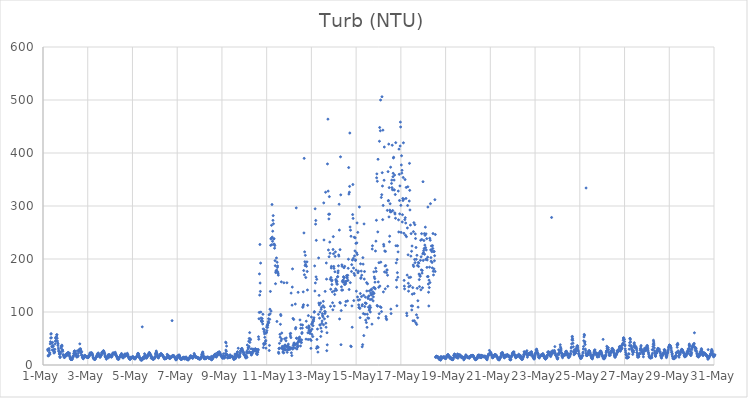
| Category | Turb (NTU) |
|---|---|
| 44317.208333333336 | 29.53 |
| 44317.21875 | 27.1 |
| 44317.229166666664 | 16.99 |
| 44317.239583333336 | 17.84 |
| 44317.25 | 17.74 |
| 44317.260416666664 | 18.66 |
| 44317.270833333336 | 31.04 |
| 44317.28125 | 28.05 |
| 44317.291666666664 | 23.07 |
| 44317.302083333336 | 23.04 |
| 44317.3125 | 20.38 |
| 44317.322916666664 | 39.78 |
| 44317.333333333336 | 43.83 |
| 44317.34375 | 50.93 |
| 44317.354166666664 | 58.24 |
| 44317.364583333336 | 59.13 |
| 44317.375 | 51.38 |
| 44317.385416666664 | 41.22 |
| 44317.395833333336 | 34.42 |
| 44317.40625 | 34.26 |
| 44317.416666666664 | 28.32 |
| 44317.427083333336 | 42.71 |
| 44317.4375 | 35.92 |
| 44317.447916666664 | 36.87 |
| 44317.458333333336 | 34.78 |
| 44317.46875 | 28.79 |
| 44317.479166666664 | 25.3 |
| 44317.489583333336 | 22.58 |
| 44317.5 | 28.66 |
| 44317.510416666664 | 23.36 |
| 44317.520833333336 | 24.81 |
| 44317.53125 | 29.56 |
| 44317.541666666664 | 39.72 |
| 44317.552083333336 | 45.12 |
| 44317.5625 | 51.73 |
| 44317.572916666664 | 50.09 |
| 44317.583333333336 | 44.76 |
| 44317.59375 | 50.29 |
| 44317.604166666664 | 53.54 |
| 44317.614583333336 | 57.08 |
| 44317.625 | 57.01 |
| 44317.635416666664 | 50.52 |
| 44317.645833333336 | 45.25 |
| 44317.65625 | 41.47 |
| 44317.666666666664 | 36.71 |
| 44317.677083333336 | 39.83 |
| 44317.6875 | 31.88 |
| 44317.697916666664 | 28.23 |
| 44317.708333333336 | 25.63 |
| 44317.71875 | 25.11 |
| 44317.729166666664 | 21.02 |
| 44317.739583333336 | 20.57 |
| 44317.75 | 16.08 |
| 44317.760416666664 | 14.14 |
| 44317.770833333336 | 15.19 |
| 44317.78125 | 21.49 |
| 44317.791666666664 | 24.6 |
| 44317.802083333336 | 31.92 |
| 44317.8125 | 35.14 |
| 44317.822916666664 | 35 |
| 44317.833333333336 | 34.84 |
| 44317.84375 | 37.42 |
| 44317.854166666664 | 35.84 |
| 44317.864583333336 | 28.8 |
| 44317.875 | 27.91 |
| 44317.885416666664 | 25.69 |
| 44317.895833333336 | 19.6 |
| 44317.90625 | 18.58 |
| 44317.916666666664 | 17.79 |
| 44317.927083333336 | 17.18 |
| 44317.9375 | 18.83 |
| 44317.947916666664 | 14.11 |
| 44317.958333333336 | 15.33 |
| 44317.96875 | 14.29 |
| 44317.979166666664 | 17.85 |
| 44317.989583333336 | 16.66 |
| 44318.0 | 16.65 |
| 44318.010416666664 | 17.85 |
| 44318.020833333336 | 16.72 |
| 44318.03125 | 19.64 |
| 44318.041666666664 | 19.91 |
| 44318.052083333336 | 21.29 |
| 44318.0625 | 20.39 |
| 44318.072916666664 | 21.08 |
| 44318.083333333336 | 21.4 |
| 44318.09375 | 18.51 |
| 44318.104166666664 | 22.32 |
| 44318.114583333336 | 22.82 |
| 44318.125 | 23.64 |
| 44318.135416666664 | 22.68 |
| 44318.145833333336 | 21.34 |
| 44318.15625 | 20.07 |
| 44318.166666666664 | 19.1 |
| 44318.177083333336 | 17.94 |
| 44318.1875 | 22.18 |
| 44318.197916666664 | 15.66 |
| 44318.208333333336 | 14.94 |
| 44318.21875 | 12.81 |
| 44318.229166666664 | 12.83 |
| 44318.239583333336 | 11.03 |
| 44318.25 | 10.22 |
| 44318.260416666664 | 10.58 |
| 44318.270833333336 | 11.24 |
| 44318.28125 | 10.34 |
| 44318.291666666664 | 10.76 |
| 44318.302083333336 | 10.43 |
| 44318.3125 | 12.4 |
| 44318.322916666664 | 14.1 |
| 44318.333333333336 | 15.01 |
| 44318.34375 | 14.95 |
| 44318.354166666664 | 17.51 |
| 44318.364583333336 | 16.93 |
| 44318.375 | 21.42 |
| 44318.385416666664 | 22.53 |
| 44318.395833333336 | 25.87 |
| 44318.40625 | 26.01 |
| 44318.416666666664 | 26.57 |
| 44318.427083333336 | 24.41 |
| 44318.4375 | 21.35 |
| 44318.447916666664 | 19.76 |
| 44318.458333333336 | 20.77 |
| 44318.46875 | 19.41 |
| 44318.479166666664 | 21.72 |
| 44318.489583333336 | 17.41 |
| 44318.5 | 17.72 |
| 44318.510416666664 | 15.11 |
| 44318.520833333336 | 15.17 |
| 44318.53125 | 26.71 |
| 44318.541666666664 | 16.85 |
| 44318.552083333336 | 16.05 |
| 44318.5625 | 16.69 |
| 44318.572916666664 | 17.76 |
| 44318.583333333336 | 22.44 |
| 44318.59375 | 27.04 |
| 44318.604166666664 | 27.56 |
| 44318.614583333336 | 26.81 |
| 44318.625 | 26.16 |
| 44318.635416666664 | 29.93 |
| 44318.645833333336 | 39.86 |
| 44318.65625 | 27.91 |
| 44318.666666666664 | 29.31 |
| 44318.677083333336 | 30.81 |
| 44318.6875 | 28.32 |
| 44318.697916666664 | 23.15 |
| 44318.708333333336 | 23.34 |
| 44318.71875 | 19.08 |
| 44318.729166666664 | 25.36 |
| 44318.739583333336 | 17.54 |
| 44318.75 | 18.35 |
| 44318.760416666664 | 14.62 |
| 44318.770833333336 | 14.75 |
| 44318.78125 | 12.84 |
| 44318.791666666664 | 13.35 |
| 44318.802083333336 | 11.7 |
| 44318.8125 | 13.34 |
| 44318.822916666664 | 13.95 |
| 44318.833333333336 | 14.89 |
| 44318.84375 | 15.34 |
| 44318.854166666664 | 18.13 |
| 44318.864583333336 | 15.1 |
| 44318.875 | 17.7 |
| 44318.885416666664 | 17.43 |
| 44318.895833333336 | 16.58 |
| 44318.90625 | 17.09 |
| 44318.916666666664 | 15.9 |
| 44318.927083333336 | 15.28 |
| 44318.9375 | 15.33 |
| 44318.947916666664 | 14.93 |
| 44318.958333333336 | 15.12 |
| 44318.96875 | 15.95 |
| 44318.979166666664 | 15.41 |
| 44318.989583333336 | 14.54 |
| 44319.0 | 14.38 |
| 44319.010416666664 | 13.8 |
| 44319.020833333336 | 14.1 |
| 44319.03125 | 14.95 |
| 44319.041666666664 | 16.16 |
| 44319.052083333336 | 15.88 |
| 44319.0625 | 16.38 |
| 44319.072916666664 | 18.39 |
| 44319.083333333336 | 19.4 |
| 44319.09375 | 22.23 |
| 44319.104166666664 | 20.69 |
| 44319.114583333336 | 23.03 |
| 44319.125 | 19.7 |
| 44319.135416666664 | 20.81 |
| 44319.145833333336 | 21.09 |
| 44319.15625 | 20.76 |
| 44319.166666666664 | 22.94 |
| 44319.177083333336 | 22.87 |
| 44319.1875 | 22.3 |
| 44319.197916666664 | 21.02 |
| 44319.208333333336 | 19.9 |
| 44319.21875 | 18.74 |
| 44319.229166666664 | 16.94 |
| 44319.239583333336 | 14.85 |
| 44319.25 | 13.61 |
| 44319.260416666664 | 12.91 |
| 44319.270833333336 | 11.56 |
| 44319.28125 | 11.71 |
| 44319.291666666664 | 11.11 |
| 44319.302083333336 | 11 |
| 44319.3125 | 10.37 |
| 44319.322916666664 | 11.26 |
| 44319.333333333336 | 10.89 |
| 44319.34375 | 12.75 |
| 44319.354166666664 | 13.73 |
| 44319.364583333336 | 14 |
| 44319.375 | 14.42 |
| 44319.385416666664 | 15.07 |
| 44319.395833333336 | 15.05 |
| 44319.40625 | 17.58 |
| 44319.416666666664 | 17.94 |
| 44319.427083333336 | 19.94 |
| 44319.4375 | 20.94 |
| 44319.447916666664 | 19.8 |
| 44319.458333333336 | 19.84 |
| 44319.46875 | 22.8 |
| 44319.479166666664 | 19.33 |
| 44319.489583333336 | 21.02 |
| 44319.5 | 17.43 |
| 44319.510416666664 | 17.71 |
| 44319.520833333336 | 16.61 |
| 44319.53125 | 16.15 |
| 44319.541666666664 | 15.07 |
| 44319.552083333336 | 14.6 |
| 44319.5625 | 15.49 |
| 44319.572916666664 | 16.82 |
| 44319.583333333336 | 17.85 |
| 44319.59375 | 17.68 |
| 44319.604166666664 | 18.45 |
| 44319.614583333336 | 20.36 |
| 44319.625 | 22.56 |
| 44319.635416666664 | 23.91 |
| 44319.645833333336 | 24.15 |
| 44319.65625 | 23.94 |
| 44319.666666666664 | 24.61 |
| 44319.677083333336 | 22.57 |
| 44319.6875 | 26.32 |
| 44319.697916666664 | 26.09 |
| 44319.708333333336 | 26.98 |
| 44319.71875 | 25.97 |
| 44319.729166666664 | 24.05 |
| 44319.739583333336 | 23.9 |
| 44319.75 | 21.15 |
| 44319.760416666664 | 20.94 |
| 44319.770833333336 | 17.21 |
| 44319.78125 | 16.45 |
| 44319.791666666664 | 15.52 |
| 44319.802083333336 | 14.38 |
| 44319.8125 | 14.25 |
| 44319.822916666664 | 13.28 |
| 44319.833333333336 | 10.83 |
| 44319.84375 | 13.34 |
| 44319.854166666664 | 14.34 |
| 44319.864583333336 | 15.72 |
| 44319.875 | 15.09 |
| 44319.885416666664 | 15.6 |
| 44319.895833333336 | 14.98 |
| 44319.90625 | 18.91 |
| 44319.916666666664 | 17.18 |
| 44319.927083333336 | 13.64 |
| 44319.9375 | 18.81 |
| 44319.947916666664 | 19.72 |
| 44319.958333333336 | 16.21 |
| 44319.96875 | 16.57 |
| 44319.979166666664 | 18.4 |
| 44319.989583333336 | 19.27 |
| 44320.0 | 17.33 |
| 44320.010416666664 | 17.35 |
| 44320.020833333336 | 16.93 |
| 44320.03125 | 15.95 |
| 44320.041666666664 | 15.38 |
| 44320.052083333336 | 15.6 |
| 44320.0625 | 14.87 |
| 44320.072916666664 | 16.39 |
| 44320.083333333336 | 16.54 |
| 44320.09375 | 17.69 |
| 44320.104166666664 | 20.12 |
| 44320.114583333336 | 21.07 |
| 44320.125 | 22.75 |
| 44320.135416666664 | 22.45 |
| 44320.145833333336 | 22.1 |
| 44320.15625 | 22.23 |
| 44320.166666666664 | 21.14 |
| 44320.177083333336 | 21.53 |
| 44320.1875 | 21.44 |
| 44320.197916666664 | 20.32 |
| 44320.208333333336 | 21.77 |
| 44320.21875 | 21.82 |
| 44320.229166666664 | 24.02 |
| 44320.239583333336 | 21.44 |
| 44320.25 | 21.08 |
| 44320.260416666664 | 19.51 |
| 44320.270833333336 | 18.13 |
| 44320.28125 | 17.35 |
| 44320.291666666664 | 16.19 |
| 44320.302083333336 | 16.24 |
| 44320.3125 | 14.15 |
| 44320.322916666664 | 12.91 |
| 44320.333333333336 | 12.2 |
| 44320.34375 | 11.06 |
| 44320.354166666664 | 11.38 |
| 44320.364583333336 | 11.4 |
| 44320.375 | 10.81 |
| 44320.385416666664 | 11.1 |
| 44320.395833333336 | 11.56 |
| 44320.40625 | 14.33 |
| 44320.416666666664 | 14.36 |
| 44320.427083333336 | 14.88 |
| 44320.4375 | 15.49 |
| 44320.447916666664 | 15.71 |
| 44320.458333333336 | 17.06 |
| 44320.46875 | 18.81 |
| 44320.479166666664 | 18.05 |
| 44320.489583333336 | 18.7 |
| 44320.5 | 20.4 |
| 44320.510416666664 | 21.72 |
| 44320.520833333336 | 18.82 |
| 44320.53125 | 18.12 |
| 44320.541666666664 | 17.05 |
| 44320.552083333336 | 14.58 |
| 44320.5625 | 13.64 |
| 44320.572916666664 | 16.35 |
| 44320.583333333336 | 13.91 |
| 44320.59375 | 13.6 |
| 44320.604166666664 | 16.01 |
| 44320.614583333336 | 17.8 |
| 44320.625 | 17.31 |
| 44320.635416666664 | 18.65 |
| 44320.645833333336 | 19.42 |
| 44320.65625 | 20.04 |
| 44320.666666666664 | 21.01 |
| 44320.677083333336 | 20.22 |
| 44320.6875 | 16.34 |
| 44320.697916666664 | 19.89 |
| 44320.708333333336 | 19.2 |
| 44320.71875 | 18.75 |
| 44320.729166666664 | 18.89 |
| 44320.739583333336 | 18.51 |
| 44320.75 | 19.48 |
| 44320.760416666664 | 19.98 |
| 44320.770833333336 | 22.07 |
| 44320.78125 | 19.62 |
| 44320.791666666664 | 18.79 |
| 44320.802083333336 | 18.67 |
| 44320.8125 | 15.36 |
| 44320.822916666664 | 15.71 |
| 44320.833333333336 | 13.66 |
| 44320.84375 | 13.23 |
| 44320.854166666664 | 11.84 |
| 44320.864583333336 | 12.13 |
| 44320.875 | 10.93 |
| 44320.885416666664 | 11.87 |
| 44320.895833333336 | 11.02 |
| 44320.90625 | 10.89 |
| 44320.916666666664 | 13.54 |
| 44320.927083333336 | 12.82 |
| 44320.9375 | 15.06 |
| 44320.947916666664 | 13.62 |
| 44320.958333333336 | 13.81 |
| 44320.96875 | 13.41 |
| 44320.979166666664 | 14.57 |
| 44320.989583333336 | 14.11 |
| 44321.0 | 14.9 |
| 44321.010416666664 | 15.61 |
| 44321.020833333336 | 15.32 |
| 44321.03125 | 15.42 |
| 44321.041666666664 | 13.97 |
| 44321.052083333336 | 13.73 |
| 44321.0625 | 14.26 |
| 44321.072916666664 | 12.56 |
| 44321.083333333336 | 12.24 |
| 44321.09375 | 11.94 |
| 44321.104166666664 | 12.22 |
| 44321.114583333336 | 11.25 |
| 44321.125 | 12.14 |
| 44321.135416666664 | 12.86 |
| 44321.145833333336 | 13.42 |
| 44321.15625 | 14.28 |
| 44321.166666666664 | 14.66 |
| 44321.177083333336 | 15.14 |
| 44321.1875 | 15.85 |
| 44321.197916666664 | 16.12 |
| 44321.208333333336 | 17.08 |
| 44321.21875 | 17.8 |
| 44321.229166666664 | 19.76 |
| 44321.239583333336 | 21.87 |
| 44321.25 | 21.6 |
| 44321.260416666664 | 21.81 |
| 44321.270833333336 | 20.03 |
| 44321.28125 | 17.15 |
| 44321.291666666664 | 17.54 |
| 44321.302083333336 | 14.69 |
| 44321.3125 | 14.54 |
| 44321.322916666664 | 14.17 |
| 44321.333333333336 | 12.46 |
| 44321.34375 | 12.23 |
| 44321.354166666664 | 11.94 |
| 44321.364583333336 | 9.83 |
| 44321.375 | 11.11 |
| 44321.385416666664 | 9.39 |
| 44321.395833333336 | 10.4 |
| 44321.40625 | 9.18 |
| 44321.416666666664 | 9.55 |
| 44321.427083333336 | 9.54 |
| 44321.4375 | 71.95 |
| 44321.447916666664 | 12.98 |
| 44321.458333333336 | 11.2 |
| 44321.46875 | 13.63 |
| 44321.479166666664 | 14.04 |
| 44321.489583333336 | 14.13 |
| 44321.5 | 13.89 |
| 44321.510416666664 | 11.87 |
| 44321.520833333336 | 14.79 |
| 44321.53125 | 15.67 |
| 44321.541666666664 | 21.26 |
| 44321.552083333336 | 18.27 |
| 44321.5625 | 17.35 |
| 44321.572916666664 | 16.79 |
| 44321.583333333336 | 16.91 |
| 44321.59375 | 13.75 |
| 44321.604166666664 | 13.32 |
| 44321.614583333336 | 13.54 |
| 44321.625 | 17.44 |
| 44321.635416666664 | 13.07 |
| 44321.645833333336 | 14.59 |
| 44321.65625 | 14.59 |
| 44321.666666666664 | 16.2 |
| 44321.677083333336 | 16.43 |
| 44321.6875 | 17.36 |
| 44321.697916666664 | 19.14 |
| 44321.708333333336 | 18.36 |
| 44321.71875 | 19.63 |
| 44321.729166666664 | 21.69 |
| 44321.739583333336 | 21.15 |
| 44321.75 | 23.51 |
| 44321.760416666664 | 23.11 |
| 44321.770833333336 | 21.4 |
| 44321.78125 | 21.39 |
| 44321.791666666664 | 19.42 |
| 44321.802083333336 | 19.01 |
| 44321.8125 | 16.86 |
| 44321.822916666664 | 18.77 |
| 44321.833333333336 | 12.96 |
| 44321.84375 | 16.03 |
| 44321.854166666664 | 16 |
| 44321.864583333336 | 15.03 |
| 44321.875 | 14.61 |
| 44321.885416666664 | 13.6 |
| 44321.895833333336 | 11.63 |
| 44321.90625 | 11.44 |
| 44321.916666666664 | 11.34 |
| 44321.927083333336 | 11.08 |
| 44321.9375 | 10.95 |
| 44321.947916666664 | 11.42 |
| 44321.958333333336 | 11.37 |
| 44321.96875 | 12.23 |
| 44321.979166666664 | 12.34 |
| 44321.989583333336 | 12.64 |
| 44322.0 | 13.33 |
| 44322.010416666664 | 15.57 |
| 44322.020833333336 | 16.04 |
| 44322.03125 | 20.67 |
| 44322.041666666664 | 21.14 |
| 44322.052083333336 | 23.61 |
| 44322.0625 | 26.37 |
| 44322.072916666664 | 24.48 |
| 44322.083333333336 | 21.68 |
| 44322.09375 | 22 |
| 44322.104166666664 | 18.98 |
| 44322.114583333336 | 16.78 |
| 44322.125 | 15.6 |
| 44322.135416666664 | 14.43 |
| 44322.145833333336 | 14.45 |
| 44322.15625 | 13.31 |
| 44322.166666666664 | 13.78 |
| 44322.177083333336 | 15.63 |
| 44322.1875 | 16.01 |
| 44322.197916666664 | 16.3 |
| 44322.208333333336 | 17.76 |
| 44322.21875 | 18.37 |
| 44322.229166666664 | 19.36 |
| 44322.239583333336 | 19.37 |
| 44322.25 | 19.24 |
| 44322.260416666664 | 19.79 |
| 44322.270833333336 | 21.54 |
| 44322.28125 | 21.5 |
| 44322.291666666664 | 19.96 |
| 44322.302083333336 | 19.95 |
| 44322.3125 | 19.58 |
| 44322.322916666664 | 19.26 |
| 44322.333333333336 | 18.59 |
| 44322.34375 | 18.51 |
| 44322.354166666664 | 17.29 |
| 44322.364583333336 | 16.83 |
| 44322.375 | 15.83 |
| 44322.385416666664 | 16.11 |
| 44322.395833333336 | 14.49 |
| 44322.40625 | 13.14 |
| 44322.416666666664 | 13.66 |
| 44322.427083333336 | 11.65 |
| 44322.4375 | 12.01 |
| 44322.447916666664 | 11.62 |
| 44322.458333333336 | 12.18 |
| 44322.46875 | 11.86 |
| 44322.479166666664 | 13.29 |
| 44322.489583333336 | 12.83 |
| 44322.5 | 12.83 |
| 44322.510416666664 | 12.47 |
| 44322.520833333336 | 12.6 |
| 44322.53125 | 14.73 |
| 44322.541666666664 | 13.78 |
| 44322.552083333336 | 20.16 |
| 44322.5625 | 16.23 |
| 44322.572916666664 | 17.6 |
| 44322.583333333336 | 18.22 |
| 44322.59375 | 16.41 |
| 44322.604166666664 | 18.05 |
| 44322.614583333336 | 16.79 |
| 44322.625 | 16.32 |
| 44322.635416666664 | 13.95 |
| 44322.645833333336 | 13.46 |
| 44322.65625 | 12.22 |
| 44322.666666666664 | 13.5 |
| 44322.677083333336 | 12.25 |
| 44322.6875 | 13.63 |
| 44322.697916666664 | 15.3 |
| 44322.708333333336 | 14.75 |
| 44322.71875 | 14.35 |
| 44322.729166666664 | 14.86 |
| 44322.739583333336 | 15.82 |
| 44322.75 | 14.91 |
| 44322.760416666664 | 15.2 |
| 44322.770833333336 | 83.68 |
| 44322.78125 | 16.59 |
| 44322.791666666664 | 18.01 |
| 44322.802083333336 | 16.84 |
| 44322.8125 | 16.99 |
| 44322.822916666664 | 16.73 |
| 44322.833333333336 | 17.05 |
| 44322.84375 | 17.91 |
| 44322.854166666664 | 15.8 |
| 44322.864583333336 | 16.39 |
| 44322.875 | 15.5 |
| 44322.885416666664 | 14.42 |
| 44322.895833333336 | 13.75 |
| 44322.90625 | 13.52 |
| 44322.916666666664 | 12.69 |
| 44322.927083333336 | 11.91 |
| 44322.9375 | 9.71 |
| 44322.947916666664 | 10.91 |
| 44322.958333333336 | 9.95 |
| 44322.96875 | 10.43 |
| 44322.979166666664 | 12.15 |
| 44322.989583333336 | 11.74 |
| 44323.0 | 13.13 |
| 44323.010416666664 | 17.24 |
| 44323.020833333336 | 14.31 |
| 44323.03125 | 15.14 |
| 44323.041666666664 | 15.37 |
| 44323.052083333336 | 15.83 |
| 44323.0625 | 18.42 |
| 44323.072916666664 | 18.24 |
| 44323.083333333336 | 16.87 |
| 44323.09375 | 18.81 |
| 44323.104166666664 | 16.5 |
| 44323.114583333336 | 16.43 |
| 44323.125 | 14.39 |
| 44323.135416666664 | 13.39 |
| 44323.145833333336 | 11.73 |
| 44323.15625 | 11.19 |
| 44323.166666666664 | 10.77 |
| 44323.177083333336 | 11.16 |
| 44323.1875 | 10.49 |
| 44323.197916666664 | 10.68 |
| 44323.208333333336 | 11.56 |
| 44323.21875 | 11.65 |
| 44323.229166666664 | 13.2 |
| 44323.239583333336 | 12.11 |
| 44323.25 | 13.43 |
| 44323.260416666664 | 12.8 |
| 44323.270833333336 | 14.8 |
| 44323.28125 | 13.43 |
| 44323.291666666664 | 13.54 |
| 44323.302083333336 | 13.73 |
| 44323.3125 | 13.49 |
| 44323.322916666664 | 12.88 |
| 44323.333333333336 | 14.38 |
| 44323.34375 | 11.02 |
| 44323.354166666664 | 12.89 |
| 44323.364583333336 | 13.92 |
| 44323.375 | 13.4 |
| 44323.385416666664 | 13.9 |
| 44323.395833333336 | 15.28 |
| 44323.40625 | 13.09 |
| 44323.416666666664 | 12.44 |
| 44323.427083333336 | 12.42 |
| 44323.4375 | 11.85 |
| 44323.447916666664 | 10.12 |
| 44323.458333333336 | 12.17 |
| 44323.46875 | 10.13 |
| 44323.479166666664 | 10.31 |
| 44323.489583333336 | 9.27 |
| 44323.5 | 11.19 |
| 44323.510416666664 | 11.85 |
| 44323.520833333336 | 11.78 |
| 44323.53125 | 12.6 |
| 44323.541666666664 | 11.81 |
| 44323.552083333336 | 14.26 |
| 44323.5625 | 14.56 |
| 44323.572916666664 | 13.14 |
| 44323.583333333336 | 16.65 |
| 44323.59375 | 17.39 |
| 44323.604166666664 | 16.33 |
| 44323.614583333336 | 15.29 |
| 44323.625 | 17.06 |
| 44323.635416666664 | 15.35 |
| 44323.645833333336 | 14.87 |
| 44323.65625 | 14.13 |
| 44323.666666666664 | 13.9 |
| 44323.677083333336 | 13.52 |
| 44323.6875 | 13.02 |
| 44323.697916666664 | 13.24 |
| 44323.708333333336 | 13.38 |
| 44323.71875 | 15.64 |
| 44323.729166666664 | 17.31 |
| 44323.739583333336 | 15.1 |
| 44323.75 | 17.1 |
| 44323.760416666664 | 21.78 |
| 44323.770833333336 | 19.54 |
| 44323.78125 | 18.18 |
| 44323.791666666664 | 17.05 |
| 44323.802083333336 | 15.92 |
| 44323.8125 | 15.6 |
| 44323.822916666664 | 15.92 |
| 44323.833333333336 | 15.18 |
| 44323.84375 | 14.11 |
| 44323.854166666664 | 14.61 |
| 44323.864583333336 | 15.04 |
| 44323.875 | 14.86 |
| 44323.885416666664 | 14.02 |
| 44323.895833333336 | 14.3 |
| 44323.90625 | 13.67 |
| 44323.916666666664 | 13.03 |
| 44323.927083333336 | 13.11 |
| 44323.9375 | 12.21 |
| 44323.947916666664 | 13.94 |
| 44323.958333333336 | 12.34 |
| 44323.96875 | 12.75 |
| 44323.979166666664 | 11.29 |
| 44323.989583333336 | 11.05 |
| 44324.0 | 11.71 |
| 44324.010416666664 | 11.52 |
| 44324.020833333336 | 11.96 |
| 44324.03125 | 11.65 |
| 44324.041666666664 | 11.73 |
| 44324.052083333336 | 12.6 |
| 44324.0625 | 13.13 |
| 44324.072916666664 | 15.42 |
| 44324.083333333336 | 14.33 |
| 44324.09375 | 20.14 |
| 44324.104166666664 | 17.71 |
| 44324.114583333336 | 16.25 |
| 44324.125 | 22.59 |
| 44324.135416666664 | 23.69 |
| 44324.145833333336 | 24.53 |
| 44324.15625 | 21.36 |
| 44324.166666666664 | 18.65 |
| 44324.177083333336 | 16.51 |
| 44324.1875 | 13.93 |
| 44324.197916666664 | 13.31 |
| 44324.208333333336 | 11.92 |
| 44324.21875 | 11.88 |
| 44324.229166666664 | 12.88 |
| 44324.239583333336 | 12.86 |
| 44324.25 | 14.77 |
| 44324.260416666664 | 13.01 |
| 44324.270833333336 | 13.79 |
| 44324.28125 | 11.73 |
| 44324.291666666664 | 14.21 |
| 44324.302083333336 | 13.33 |
| 44324.3125 | 13.47 |
| 44324.322916666664 | 14.36 |
| 44324.333333333336 | 14.89 |
| 44324.34375 | 14.22 |
| 44324.354166666664 | 14.22 |
| 44324.364583333336 | 14.94 |
| 44324.375 | 14.85 |
| 44324.385416666664 | 14.02 |
| 44324.395833333336 | 14.33 |
| 44324.40625 | 13.68 |
| 44324.416666666664 | 13.53 |
| 44324.427083333336 | 12.26 |
| 44324.4375 | 12.87 |
| 44324.447916666664 | 13.65 |
| 44324.458333333336 | 12.98 |
| 44324.46875 | 11.81 |
| 44324.479166666664 | 13.24 |
| 44324.489583333336 | 11.8 |
| 44324.5 | 11.55 |
| 44324.510416666664 | 11.16 |
| 44324.520833333336 | 11.99 |
| 44324.53125 | 16.22 |
| 44324.541666666664 | 9.63 |
| 44324.552083333336 | 13.27 |
| 44324.5625 | 12.92 |
| 44324.572916666664 | 11.02 |
| 44324.583333333336 | 12.33 |
| 44324.59375 | 13.41 |
| 44324.604166666664 | 13.78 |
| 44324.614583333336 | 14.07 |
| 44324.625 | 16.48 |
| 44324.635416666664 | 17.98 |
| 44324.645833333336 | 16.72 |
| 44324.65625 | 18.57 |
| 44324.666666666664 | 18.27 |
| 44324.677083333336 | 19.79 |
| 44324.6875 | 19.89 |
| 44324.697916666664 | 19.79 |
| 44324.708333333336 | 20.78 |
| 44324.71875 | 18.16 |
| 44324.729166666664 | 16.52 |
| 44324.739583333336 | 15.28 |
| 44324.75 | 15.06 |
| 44324.760416666664 | 16.49 |
| 44324.770833333336 | 17.96 |
| 44324.78125 | 17.62 |
| 44324.791666666664 | 17.53 |
| 44324.802083333336 | 23.18 |
| 44324.8125 | 23.04 |
| 44324.822916666664 | 19.84 |
| 44324.833333333336 | 21.13 |
| 44324.84375 | 21.09 |
| 44324.854166666664 | 20.58 |
| 44324.864583333336 | 22.49 |
| 44324.875 | 25.08 |
| 44324.885416666664 | 23.91 |
| 44324.895833333336 | 23.41 |
| 44324.90625 | 22.21 |
| 44324.916666666664 | 22.43 |
| 44324.927083333336 | 20.04 |
| 44324.9375 | 19.15 |
| 44324.947916666664 | 18.35 |
| 44324.958333333336 | 16.8 |
| 44324.96875 | 18.43 |
| 44324.979166666664 | 18.17 |
| 44324.989583333336 | 15.37 |
| 44325.0 | 15.2 |
| 44325.010416666664 | 15.25 |
| 44325.020833333336 | 12.75 |
| 44325.03125 | 13.77 |
| 44325.041666666664 | 13.86 |
| 44325.052083333336 | 15.19 |
| 44325.0625 | 17.05 |
| 44325.072916666664 | 21.09 |
| 44325.083333333336 | 13.54 |
| 44325.09375 | 12.65 |
| 44325.104166666664 | 16.05 |
| 44325.114583333336 | 13.66 |
| 44325.125 | 14.5 |
| 44325.135416666664 | 15.99 |
| 44325.145833333336 | 17.29 |
| 44325.15625 | 21.87 |
| 44325.166666666664 | 43.07 |
| 44325.177083333336 | 28.1 |
| 44325.1875 | 41.58 |
| 44325.197916666664 | 25.85 |
| 44325.208333333336 | 35.67 |
| 44325.21875 | 19.96 |
| 44325.229166666664 | 19.45 |
| 44325.239583333336 | 18.66 |
| 44325.25 | 14.15 |
| 44325.260416666664 | 13.04 |
| 44325.270833333336 | 14.28 |
| 44325.28125 | 14.2 |
| 44325.291666666664 | 15.79 |
| 44325.302083333336 | 14.66 |
| 44325.3125 | 14.27 |
| 44325.322916666664 | 15.31 |
| 44325.333333333336 | 14.26 |
| 44325.34375 | 15.17 |
| 44325.354166666664 | 16.34 |
| 44325.364583333336 | 19.25 |
| 44325.375 | 14.26 |
| 44325.385416666664 | 15.68 |
| 44325.395833333336 | 15.49 |
| 44325.40625 | 16.55 |
| 44325.416666666664 | 16.23 |
| 44325.427083333336 | 16.14 |
| 44325.4375 | 15.75 |
| 44325.447916666664 | 15.77 |
| 44325.458333333336 | 16.54 |
| 44325.46875 | 15.91 |
| 44325.479166666664 | 14.49 |
| 44325.489583333336 | 15.43 |
| 44325.5 | 14.36 |
| 44325.510416666664 | 14 |
| 44325.520833333336 | 13.03 |
| 44325.53125 | 10.52 |
| 44325.541666666664 | 10.76 |
| 44325.552083333336 | 13.05 |
| 44325.5625 | 12.15 |
| 44325.572916666664 | 15.26 |
| 44325.583333333336 | 20.53 |
| 44325.59375 | 17.02 |
| 44325.604166666664 | 12.07 |
| 44325.614583333336 | 13.35 |
| 44325.625 | 13.78 |
| 44325.635416666664 | 20.56 |
| 44325.645833333336 | 18.75 |
| 44325.65625 | 17.63 |
| 44325.666666666664 | 21.26 |
| 44325.677083333336 | 21.21 |
| 44325.6875 | 24.22 |
| 44325.697916666664 | 24.95 |
| 44325.708333333336 | 18.95 |
| 44325.71875 | 17.1 |
| 44325.729166666664 | 31.61 |
| 44325.739583333336 | 17.18 |
| 44325.75 | 15.06 |
| 44325.760416666664 | 15.01 |
| 44325.770833333336 | 16.23 |
| 44325.78125 | 15.24 |
| 44325.791666666664 | 18.1 |
| 44325.802083333336 | 15.76 |
| 44325.8125 | 21.57 |
| 44325.822916666664 | 23.09 |
| 44325.833333333336 | 26.36 |
| 44325.84375 | 26.86 |
| 44325.854166666664 | 26.9 |
| 44325.864583333336 | 29.77 |
| 44325.875 | 30.61 |
| 44325.885416666664 | 30.84 |
| 44325.895833333336 | 31.25 |
| 44325.90625 | 28.64 |
| 44325.916666666664 | 27.68 |
| 44325.927083333336 | 26.99 |
| 44325.9375 | 24.6 |
| 44325.947916666664 | 24.96 |
| 44325.958333333336 | 23.85 |
| 44325.96875 | 22.78 |
| 44325.979166666664 | 19.87 |
| 44325.989583333336 | 19.86 |
| 44326.0 | 22.11 |
| 44326.010416666664 | 18.84 |
| 44326.020833333336 | 17.82 |
| 44326.03125 | 17.7 |
| 44326.041666666664 | 15.34 |
| 44326.052083333336 | 15.13 |
| 44326.0625 | 16.47 |
| 44326.072916666664 | 12.99 |
| 44326.083333333336 | 18.22 |
| 44326.09375 | 16.01 |
| 44326.104166666664 | 23.62 |
| 44326.114583333336 | 25.82 |
| 44326.125 | 14.53 |
| 44326.135416666664 | 37.65 |
| 44326.145833333336 | 23.51 |
| 44326.15625 | 22.7 |
| 44326.166666666664 | 29.74 |
| 44326.177083333336 | 32.8 |
| 44326.1875 | 32.5 |
| 44326.197916666664 | 44.91 |
| 44326.208333333336 | 35.22 |
| 44326.21875 | 49.99 |
| 44326.229166666664 | 25.09 |
| 44326.239583333336 | 61.07 |
| 44326.25 | 42.64 |
| 44326.260416666664 | 49.39 |
| 44326.270833333336 | 22.41 |
| 44326.28125 | 47.75 |
| 44326.291666666664 | 23.26 |
| 44326.302083333336 | 30.6 |
| 44326.3125 | 18.73 |
| 44326.322916666664 | 21.73 |
| 44326.333333333336 | 19.89 |
| 44326.34375 | 21.84 |
| 44326.354166666664 | 21.9 |
| 44326.364583333336 | 24.6 |
| 44326.375 | 25.19 |
| 44326.385416666664 | 30.22 |
| 44326.395833333336 | 28.62 |
| 44326.40625 | 26.66 |
| 44326.416666666664 | 28.06 |
| 44326.427083333336 | 26.56 |
| 44326.4375 | 28.82 |
| 44326.447916666664 | 28.77 |
| 44326.458333333336 | 26.6 |
| 44326.46875 | 28.29 |
| 44326.479166666664 | 29.67 |
| 44326.489583333336 | 30.63 |
| 44326.5 | 29.91 |
| 44326.510416666664 | 28.49 |
| 44326.520833333336 | 27.03 |
| 44326.53125 | 25.71 |
| 44326.541666666664 | 21.52 |
| 44326.552083333336 | 21.69 |
| 44326.5625 | 29.49 |
| 44326.572916666664 | 20.42 |
| 44326.583333333336 | 19.78 |
| 44326.59375 | 24.26 |
| 44326.604166666664 | 24.28 |
| 44326.614583333336 | 27.45 |
| 44326.625 | 29.31 |
| 44326.635416666664 | 53.27 |
| 44326.645833333336 | 48.6 |
| 44326.65625 | 87.28 |
| 44326.666666666664 | 99.16 |
| 44326.677083333336 | 171.86 |
| 44326.6875 | 131.9 |
| 44326.697916666664 | 227.42 |
| 44326.708333333336 | 154.66 |
| 44326.71875 | 138.79 |
| 44326.729166666664 | 192.29 |
| 44326.739583333336 | 99.81 |
| 44326.75 | 88.77 |
| 44326.760416666664 | 84.07 |
| 44326.770833333336 | 82.07 |
| 44326.78125 | 82.96 |
| 44326.791666666664 | 82.29 |
| 44326.802083333336 | 87.48 |
| 44326.8125 | 82.64 |
| 44326.822916666664 | 77.49 |
| 44326.833333333336 | 95.66 |
| 44326.84375 | 68.09 |
| 44326.854166666664 | 32.87 |
| 44326.864583333336 | 40.51 |
| 44326.875 | 38.16 |
| 44326.885416666664 | 62.65 |
| 44326.895833333336 | 66.36 |
| 44326.90625 | 58.67 |
| 44326.916666666664 | 52.19 |
| 44326.927083333336 | 40.65 |
| 44326.9375 | 40.14 |
| 44326.947916666664 | 44.5 |
| 44326.958333333336 | 46.36 |
| 44326.96875 | 31.8 |
| 44326.979166666664 | 60.46 |
| 44326.989583333336 | 61.52 |
| 44327.0 | 71.45 |
| 44327.010416666664 | 64.79 |
| 44327.020833333336 | 74.1 |
| 44327.03125 | 75.69 |
| 44327.041666666664 | 70.98 |
| 44327.052083333336 | 75.33 |
| 44327.0625 | 78.61 |
| 44327.072916666664 | 81.96 |
| 44327.083333333336 | 87.35 |
| 44327.09375 | 80.05 |
| 44327.104166666664 | 94.65 |
| 44327.114583333336 | 27.39 |
| 44327.125 | 37 |
| 44327.135416666664 | 86.17 |
| 44327.145833333336 | 105.26 |
| 44327.15625 | 96.57 |
| 44327.166666666664 | 138.79 |
| 44327.177083333336 | 225.71 |
| 44327.1875 | 237.95 |
| 44327.197916666664 | 101.72 |
| 44327.208333333336 | 239.35 |
| 44327.21875 | 263.62 |
| 44327.229166666664 | 227 |
| 44327.239583333336 | 302.82 |
| 44327.25 | 241.25 |
| 44327.260416666664 | 233.45 |
| 44327.270833333336 | 252.46 |
| 44327.28125 | 272.9 |
| 44327.291666666664 | 281.85 |
| 44327.302083333336 | 266.44 |
| 44327.3125 | 237.72 |
| 44327.322916666664 | 228.04 |
| 44327.333333333336 | 238.37 |
| 44327.34375 | 227.79 |
| 44327.354166666664 | 220.38 |
| 44327.364583333336 | 225.35 |
| 44327.375 | 196.94 |
| 44327.385416666664 | 187.33 |
| 44327.395833333336 | 153.39 |
| 44327.40625 | 174.27 |
| 44327.416666666664 | 176.81 |
| 44327.427083333336 | 177.96 |
| 44327.4375 | 201.94 |
| 44327.447916666664 | 178.86 |
| 44327.458333333336 | 82.16 |
| 44327.46875 | 193.85 |
| 44327.479166666664 | 184.13 |
| 44327.489583333336 | 186.84 |
| 44327.5 | 175.38 |
| 44327.510416666664 | 172.7 |
| 44327.520833333336 | 169.5 |
| 44327.53125 | 24.08 |
| 44327.541666666664 | 21.93 |
| 44327.552083333336 | 31.08 |
| 44327.5625 | 31.3 |
| 44327.572916666664 | 40.84 |
| 44327.583333333336 | 31.54 |
| 44327.59375 | 57.89 |
| 44327.604166666664 | 52.47 |
| 44327.614583333336 | 76.82 |
| 44327.625 | 95.34 |
| 44327.635416666664 | 93.24 |
| 44327.645833333336 | 45.73 |
| 44327.65625 | 156.87 |
| 44327.666666666664 | 49.1 |
| 44327.677083333336 | 60.37 |
| 44327.6875 | 32.53 |
| 44327.697916666664 | 35.16 |
| 44327.708333333336 | 29.98 |
| 44327.71875 | 31.32 |
| 44327.729166666664 | 24.67 |
| 44327.739583333336 | 23.99 |
| 44327.75 | 28.93 |
| 44327.760416666664 | 22.84 |
| 44327.770833333336 | 155.12 |
| 44327.78125 | 35.62 |
| 44327.791666666664 | 31.99 |
| 44327.802083333336 | 49.33 |
| 44327.8125 | 28.85 |
| 44327.822916666664 | 37.8 |
| 44327.833333333336 | 36.42 |
| 44327.84375 | 28.74 |
| 44327.854166666664 | 28.9 |
| 44327.864583333336 | 45.58 |
| 44327.875 | 51.06 |
| 44327.885416666664 | 34.14 |
| 44327.895833333336 | 35.21 |
| 44327.90625 | 155.12 |
| 44327.916666666664 | 23.95 |
| 44327.927083333336 | 35.02 |
| 44327.9375 | 29.42 |
| 44327.947916666664 | 35.86 |
| 44327.958333333336 | 29.08 |
| 44327.96875 | 39.38 |
| 44327.979166666664 | 29.09 |
| 44327.989583333336 | 34.32 |
| 44328.0 | 30.47 |
| 44328.010416666664 | 31.85 |
| 44328.020833333336 | 32.07 |
| 44328.03125 | 33.1 |
| 44328.041666666664 | 29.46 |
| 44328.052083333336 | 58.88 |
| 44328.0625 | 54.64 |
| 44328.072916666664 | 59.67 |
| 44328.083333333336 | 51.59 |
| 44328.09375 | 135.65 |
| 44328.104166666664 | 22.97 |
| 44328.114583333336 | 32.1 |
| 44328.125 | 17.81 |
| 44328.135416666664 | 112.91 |
| 44328.145833333336 | 147 |
| 44328.15625 | 181.33 |
| 44328.166666666664 | 29.99 |
| 44328.177083333336 | 87.78 |
| 44328.1875 | 37.17 |
| 44328.197916666664 | 33.51 |
| 44328.208333333336 | 85.88 |
| 44328.21875 | 40.55 |
| 44328.229166666664 | 41.72 |
| 44328.239583333336 | 39.89 |
| 44328.25 | 38.95 |
| 44328.260416666664 | 37.53 |
| 44328.270833333336 | 31.88 |
| 44328.28125 | 114.99 |
| 44328.291666666664 | 68.13 |
| 44328.302083333336 | 70.65 |
| 44328.3125 | 39.31 |
| 44328.322916666664 | 296.42 |
| 44328.333333333336 | 50.65 |
| 44328.34375 | 50.36 |
| 44328.354166666664 | 30.2 |
| 44328.364583333336 | 41.01 |
| 44328.375 | 34.6 |
| 44328.385416666664 | 34.27 |
| 44328.395833333336 | 36.99 |
| 44328.40625 | 137.15 |
| 44328.416666666664 | 44.44 |
| 44328.427083333336 | 43.41 |
| 44328.4375 | 48.8 |
| 44328.447916666664 | 46.81 |
| 44328.458333333336 | 50.92 |
| 44328.46875 | 52.71 |
| 44328.479166666664 | 48.47 |
| 44328.489583333336 | 85.04 |
| 44328.5 | 45.2 |
| 44328.510416666664 | 35.84 |
| 44328.520833333336 | 69.29 |
| 44328.53125 | 76.12 |
| 44328.541666666664 | 43.2 |
| 44328.552083333336 | 42.11 |
| 44328.5625 | 47.42 |
| 44328.572916666664 | 59.39 |
| 44328.583333333336 | 61.3 |
| 44328.59375 | 69.58 |
| 44328.604166666664 | 75.47 |
| 44328.614583333336 | 108.72 |
| 44328.625 | 110.72 |
| 44328.635416666664 | 137.98 |
| 44328.645833333336 | 113.68 |
| 44328.65625 | 178.22 |
| 44328.666666666664 | 249.18 |
| 44328.677083333336 | 389.89 |
| 44328.6875 | 170.21 |
| 44328.697916666664 | 213.48 |
| 44328.708333333336 | 194.86 |
| 44328.71875 | 187.52 |
| 44328.729166666664 | 206.93 |
| 44328.739583333336 | 189.95 |
| 44328.75 | 165.07 |
| 44328.760416666664 | 48.79 |
| 44328.770833333336 | 82.65 |
| 44328.78125 | 186.13 |
| 44328.791666666664 | 71.12 |
| 44328.802083333336 | 194.62 |
| 44328.8125 | 176.44 |
| 44328.822916666664 | 141.55 |
| 44328.833333333336 | 112.6 |
| 44328.84375 | 60.77 |
| 44328.854166666664 | 48.14 |
| 44328.864583333336 | 93.19 |
| 44328.875 | 68.92 |
| 44328.885416666664 | 73.91 |
| 44328.895833333336 | 65.16 |
| 44328.90625 | 71.39 |
| 44328.916666666664 | 60.11 |
| 44328.927083333336 | 63.66 |
| 44328.9375 | 59.85 |
| 44328.947916666664 | 48.39 |
| 44328.958333333336 | 63.42 |
| 44328.96875 | 65.81 |
| 44328.979166666664 | 31.41 |
| 44328.989583333336 | 46.29 |
| 44329.0 | 90.49 |
| 44329.010416666664 | 77.02 |
| 44329.020833333336 | 57.77 |
| 44329.03125 | 67.68 |
| 44329.041666666664 | 78.41 |
| 44329.052083333336 | 81.01 |
| 44329.0625 | 53.69 |
| 44329.072916666664 | 74.24 |
| 44329.083333333336 | 84.72 |
| 44329.09375 | 82.66 |
| 44329.104166666664 | 86.62 |
| 44329.114583333336 | 89.14 |
| 44329.125 | 99.6 |
| 44329.135416666664 | 100.72 |
| 44329.145833333336 | 186.93 |
| 44329.15625 | 139.57 |
| 44329.166666666664 | 294.68 |
| 44329.177083333336 | 154.79 |
| 44329.1875 | 265.73 |
| 44329.197916666664 | 272.68 |
| 44329.208333333336 | 166.29 |
| 44329.21875 | 235.18 |
| 44329.229166666664 | 31.46 |
| 44329.239583333336 | 161.64 |
| 44329.25 | 48.27 |
| 44329.260416666664 | 34.74 |
| 44329.270833333336 | 67.82 |
| 44329.28125 | 33.35 |
| 44329.291666666664 | 24.32 |
| 44329.302083333336 | 33.56 |
| 44329.3125 | 95.47 |
| 44329.322916666664 | 201.96 |
| 44329.333333333336 | 116.86 |
| 44329.34375 | 131.41 |
| 44329.354166666664 | 113.34 |
| 44329.364583333336 | 88.43 |
| 44329.375 | 75.59 |
| 44329.385416666664 | 100.12 |
| 44329.395833333336 | 75.39 |
| 44329.40625 | 116.9 |
| 44329.416666666664 | 53.9 |
| 44329.427083333336 | 69.6 |
| 44329.4375 | 105.05 |
| 44329.447916666664 | 108.58 |
| 44329.458333333336 | 63.22 |
| 44329.46875 | 78.68 |
| 44329.479166666664 | 83.06 |
| 44329.489583333336 | 96.84 |
| 44329.5 | 93.59 |
| 44329.510416666664 | 91.02 |
| 44329.520833333336 | 111.73 |
| 44329.53125 | 120.09 |
| 44329.541666666664 | 75.82 |
| 44329.552083333336 | 305.86 |
| 44329.5625 | 235.9 |
| 44329.572916666664 | 108.9 |
| 44329.583333333336 | 87.11 |
| 44329.59375 | 101.16 |
| 44329.604166666664 | 97.19 |
| 44329.614583333336 | 138.91 |
| 44329.625 | 100.14 |
| 44329.635416666664 | 325.95 |
| 44329.645833333336 | 78.86 |
| 44329.65625 | 71.27 |
| 44329.666666666664 | 192.49 |
| 44329.677083333336 | 162.01 |
| 44329.6875 | 26.99 |
| 44329.697916666664 | 60.85 |
| 44329.708333333336 | 38.05 |
| 44329.71875 | 379.38 |
| 44329.729166666664 | 91.56 |
| 44329.739583333336 | 463.86 |
| 44329.75 | 328.1 |
| 44329.760416666664 | 216.99 |
| 44329.770833333336 | 284.38 |
| 44329.78125 | 275.55 |
| 44329.791666666664 | 204.25 |
| 44329.802083333336 | 317.66 |
| 44329.8125 | 284.58 |
| 44329.822916666664 | 231.93 |
| 44329.833333333336 | 210.85 |
| 44329.84375 | 161.58 |
| 44329.854166666664 | 110.74 |
| 44329.864583333336 | 143 |
| 44329.875 | 164.95 |
| 44329.885416666664 | 183.06 |
| 44329.895833333336 | 186.12 |
| 44329.90625 | 158.67 |
| 44329.916666666664 | 151.84 |
| 44329.927083333336 | 160.05 |
| 44329.9375 | 137.98 |
| 44329.947916666664 | 117.41 |
| 44329.958333333336 | 104.11 |
| 44329.96875 | 217.93 |
| 44329.979166666664 | 242.21 |
| 44329.989583333336 | 209.9 |
| 44330.0 | 185.99 |
| 44330.010416666664 | 182.27 |
| 44330.020833333336 | 111.29 |
| 44330.03125 | 139.75 |
| 44330.041666666664 | 133.09 |
| 44330.052083333336 | 175.92 |
| 44330.0625 | 204.89 |
| 44330.072916666664 | 213.42 |
| 44330.083333333336 | 143.7 |
| 44330.09375 | 161.35 |
| 44330.104166666664 | 159.79 |
| 44330.114583333336 | 156.86 |
| 44330.125 | 140.96 |
| 44330.135416666664 | 152.96 |
| 44330.145833333336 | 157.8 |
| 44330.15625 | 152.45 |
| 44330.166666666664 | 166.14 |
| 44330.177083333336 | 166.82 |
| 44330.1875 | 173.83 |
| 44330.197916666664 | 177.55 |
| 44330.208333333336 | 187.15 |
| 44330.21875 | 207.55 |
| 44330.229166666664 | 205.49 |
| 44330.239583333336 | 303.35 |
| 44330.25 | 254.57 |
| 44330.260416666664 | 86.87 |
| 44330.270833333336 | 117.95 |
| 44330.28125 | 217.66 |
| 44330.291666666664 | 116.73 |
| 44330.302083333336 | 392.77 |
| 44330.3125 | 321.02 |
| 44330.322916666664 | 38.34 |
| 44330.333333333336 | 102.68 |
| 44330.34375 | 147.49 |
| 44330.354166666664 | 141.24 |
| 44330.364583333336 | 188.95 |
| 44330.375 | 186.2 |
| 44330.385416666664 | 157.77 |
| 44330.395833333336 | 141.47 |
| 44330.40625 | 159.71 |
| 44330.416666666664 | 156.03 |
| 44330.427083333336 | 160.15 |
| 44330.4375 | 166.61 |
| 44330.447916666664 | 165.57 |
| 44330.458333333336 | 183.45 |
| 44330.46875 | 164.6 |
| 44330.479166666664 | 152.06 |
| 44330.489583333336 | 186.17 |
| 44330.5 | 156.45 |
| 44330.510416666664 | 152.22 |
| 44330.520833333336 | 112.5 |
| 44330.53125 | 153.87 |
| 44330.541666666664 | 119.82 |
| 44330.552083333336 | 158 |
| 44330.5625 | 158.18 |
| 44330.572916666664 | 168.61 |
| 44330.583333333336 | 165.56 |
| 44330.59375 | 168.31 |
| 44330.604166666664 | 164.23 |
| 44330.614583333336 | 120.93 |
| 44330.625 | 169.18 |
| 44330.635416666664 | 159.67 |
| 44330.645833333336 | 182.44 |
| 44330.65625 | 199.59 |
| 44330.666666666664 | 372.51 |
| 44330.677083333336 | 322.52 |
| 44330.6875 | 142.46 |
| 44330.697916666664 | 325.94 |
| 44330.708333333336 | 336.97 |
| 44330.71875 | 437.68 |
| 44330.729166666664 | 260.39 |
| 44330.739583333336 | 155.37 |
| 44330.75 | 254.35 |
| 44330.760416666664 | 35.75 |
| 44330.770833333336 | 242.9 |
| 44330.78125 | 34.7 |
| 44330.791666666664 | 176.48 |
| 44330.802083333336 | 189.31 |
| 44330.8125 | 111.46 |
| 44330.822916666664 | 71.27 |
| 44330.833333333336 | 198.05 |
| 44330.84375 | 283.82 |
| 44330.854166666664 | 340.54 |
| 44330.864583333336 | 276.58 |
| 44330.875 | 201.11 |
| 44330.885416666664 | 182.93 |
| 44330.895833333336 | 121.5 |
| 44330.90625 | 172.67 |
| 44330.916666666664 | 240.93 |
| 44330.927083333336 | 205.82 |
| 44330.9375 | 169.12 |
| 44330.947916666664 | 215.27 |
| 44330.958333333336 | 239.93 |
| 44330.96875 | 197.22 |
| 44330.979166666664 | 198.31 |
| 44330.989583333336 | 229.48 |
| 44331.0 | 178.99 |
| 44331.010416666664 | 139.29 |
| 44331.020833333336 | 211.8 |
| 44331.03125 | 230.4 |
| 44331.041666666664 | 268.06 |
| 44331.052083333336 | 208.49 |
| 44331.0625 | 128.37 |
| 44331.072916666664 | 250.26 |
| 44331.083333333336 | 174.01 |
| 44331.09375 | 122.33 |
| 44331.104166666664 | 176.92 |
| 44331.114583333336 | 113.45 |
| 44331.125 | 108.48 |
| 44331.135416666664 | 108.09 |
| 44331.145833333336 | 298.17 |
| 44331.15625 | 123.21 |
| 44331.166666666664 | 106.68 |
| 44331.177083333336 | 89.29 |
| 44331.1875 | 134.85 |
| 44331.197916666664 | 190.9 |
| 44331.208333333336 | 163.41 |
| 44331.21875 | 165 |
| 44331.229166666664 | 177.15 |
| 44331.239583333336 | 129.07 |
| 44331.25 | 169.4 |
| 44331.260416666664 | 111.36 |
| 44331.270833333336 | 34.3 |
| 44331.28125 | 113.89 |
| 44331.291666666664 | 38.38 |
| 44331.302083333336 | 202.5 |
| 44331.3125 | 190.27 |
| 44331.322916666664 | 97.03 |
| 44331.333333333336 | 131.55 |
| 44331.34375 | 55.52 |
| 44331.354166666664 | 266.16 |
| 44331.364583333336 | 162.13 |
| 44331.375 | 176.35 |
| 44331.385416666664 | 110.31 |
| 44331.395833333336 | 95.83 |
| 44331.40625 | 117.17 |
| 44331.416666666664 | 128.02 |
| 44331.427083333336 | 84.62 |
| 44331.4375 | 116.38 |
| 44331.447916666664 | 116.31 |
| 44331.458333333336 | 80.11 |
| 44331.46875 | 155.4 |
| 44331.479166666664 | 139.61 |
| 44331.489583333336 | 71.06 |
| 44331.5 | 95.78 |
| 44331.510416666664 | 153.19 |
| 44331.520833333336 | 88.78 |
| 44331.53125 | 125.48 |
| 44331.541666666664 | 128.46 |
| 44331.552083333336 | 109.04 |
| 44331.5625 | 88.21 |
| 44331.572916666664 | 130.5 |
| 44331.583333333336 | 103.38 |
| 44331.59375 | 139.91 |
| 44331.604166666664 | 105.51 |
| 44331.614583333336 | 111.87 |
| 44331.625 | 123.51 |
| 44331.635416666664 | 100.03 |
| 44331.645833333336 | 108.5 |
| 44331.65625 | 135.7 |
| 44331.666666666664 | 141.09 |
| 44331.677083333336 | 132.15 |
| 44331.6875 | 143.06 |
| 44331.697916666664 | 124.09 |
| 44331.708333333336 | 77.07 |
| 44331.71875 | 218.8 |
| 44331.729166666664 | 224.9 |
| 44331.739583333336 | 133.42 |
| 44331.75 | 138.07 |
| 44331.760416666664 | 120.9 |
| 44331.770833333336 | 128.53 |
| 44331.78125 | 145.96 |
| 44331.791666666664 | 175.69 |
| 44331.802083333336 | 135.2 |
| 44331.8125 | 166.19 |
| 44331.822916666664 | 145.83 |
| 44331.833333333336 | 162.92 |
| 44331.84375 | 156.25 |
| 44331.854166666664 | 143.79 |
| 44331.864583333336 | 215.08 |
| 44331.875 | 182.59 |
| 44331.885416666664 | 233.68 |
| 44331.895833333336 | 176.54 |
| 44331.90625 | 273.06 |
| 44331.916666666664 | 353.23 |
| 44331.927083333336 | 360.55 |
| 44331.9375 | 112.31 |
| 44331.947916666664 | 346.65 |
| 44331.958333333336 | 110.94 |
| 44331.96875 | 251.1 |
| 44331.979166666664 | 388.14 |
| 44331.989583333336 | 156.72 |
| 44332.0 | 88.78 |
| 44332.010416666664 | 146.61 |
| 44332.020833333336 | 193 |
| 44332.03125 | 96.82 |
| 44332.041666666664 | 422.14 |
| 44332.052083333336 | 448.11 |
| 44332.0625 | 148.96 |
| 44332.072916666664 | 110.07 |
| 44332.083333333336 | 441.97 |
| 44332.09375 | 499.96 |
| 44332.104166666664 | 194.06 |
| 44332.114583333336 | 108.57 |
| 44332.125 | 316.15 |
| 44332.135416666664 | 100.75 |
| 44332.145833333336 | 321.36 |
| 44332.15625 | 506.14 |
| 44332.166666666664 | 362.81 |
| 44332.177083333336 | 337.68 |
| 44332.1875 | 274.27 |
| 44332.197916666664 | 443.13 |
| 44332.208333333336 | 301.03 |
| 44332.21875 | 137.88 |
| 44332.229166666664 | 227.56 |
| 44332.239583333336 | 224.38 |
| 44332.25 | 348.58 |
| 44332.260416666664 | 411.28 |
| 44332.270833333336 | 175.61 |
| 44332.28125 | 215.13 |
| 44332.291666666664 | 186.72 |
| 44332.302083333336 | 143.68 |
| 44332.3125 | 214.34 |
| 44332.322916666664 | 187.58 |
| 44332.333333333336 | 91.5 |
| 44332.34375 | 88.05 |
| 44332.354166666664 | 174.26 |
| 44332.364583333336 | 85.64 |
| 44332.375 | 178.94 |
| 44332.385416666664 | 179.4 |
| 44332.395833333336 | 291.72 |
| 44332.40625 | 169.39 |
| 44332.416666666664 | 148.49 |
| 44332.427083333336 | 364.87 |
| 44332.4375 | 309.81 |
| 44332.447916666664 | 310.31 |
| 44332.458333333336 | 416.74 |
| 44332.46875 | 279.4 |
| 44332.479166666664 | 334.67 |
| 44332.489583333336 | 232.5 |
| 44332.5 | 243.09 |
| 44332.510416666664 | 292.26 |
| 44332.520833333336 | 304.25 |
| 44332.53125 | 288.96 |
| 44332.541666666664 | 373.18 |
| 44332.552083333336 | 105.42 |
| 44332.5625 | 97.01 |
| 44332.572916666664 | 289.37 |
| 44332.583333333336 | 342.59 |
| 44332.59375 | 348.84 |
| 44332.604166666664 | 334.66 |
| 44332.614583333336 | 414.71 |
| 44332.625 | 330.67 |
| 44332.635416666664 | 291.34 |
| 44332.645833333336 | 355.19 |
| 44332.65625 | 361.67 |
| 44332.666666666664 | 390.65 |
| 44332.677083333336 | 391.95 |
| 44332.6875 | 330.67 |
| 44332.697916666664 | 348.91 |
| 44332.708333333336 | 330.23 |
| 44332.71875 | 358.32 |
| 44332.729166666664 | 287.03 |
| 44332.739583333336 | 284.87 |
| 44332.75 | 321.65 |
| 44332.760416666664 | 276.83 |
| 44332.770833333336 | 419.49 |
| 44332.78125 | 225.02 |
| 44332.791666666664 | 192.65 |
| 44332.802083333336 | 160.46 |
| 44332.8125 | 146.66 |
| 44332.822916666664 | 111.71 |
| 44332.833333333336 | 198.98 |
| 44332.84375 | 174.17 |
| 44332.854166666664 | 224.96 |
| 44332.864583333336 | 165.52 |
| 44332.875 | 213.41 |
| 44332.885416666664 | 328.17 |
| 44332.895833333336 | 273.86 |
| 44332.90625 | 251.01 |
| 44332.916666666664 | 407.3 |
| 44332.927083333336 | 359.78 |
| 44332.9375 | 310.37 |
| 44332.947916666664 | 285.14 |
| 44332.958333333336 | 337.86 |
| 44332.96875 | 413.19 |
| 44332.979166666664 | 458.32 |
| 44332.989583333336 | 449.11 |
| 44333.0 | 301.18 |
| 44333.010416666664 | 250.19 |
| 44333.020833333336 | 377.41 |
| 44333.03125 | 394.8 |
| 44333.041666666664 | 361.99 |
| 44333.052083333336 | 367.35 |
| 44333.0625 | 269.93 |
| 44333.072916666664 | 283.56 |
| 44333.083333333336 | 314.15 |
| 44333.09375 | 310.37 |
| 44333.104166666664 | 353.86 |
| 44333.114583333336 | 419.21 |
| 44333.125 | 313.11 |
| 44333.135416666664 | 248.52 |
| 44333.145833333336 | 159.66 |
| 44333.15625 | 148.84 |
| 44333.166666666664 | 143.6 |
| 44333.177083333336 | 274.33 |
| 44333.1875 | 349.93 |
| 44333.197916666664 | 277.96 |
| 44333.208333333336 | 244.72 |
| 44333.21875 | 267.82 |
| 44333.229166666664 | 314.28 |
| 44333.239583333336 | 335.08 |
| 44333.25 | 242.12 |
| 44333.260416666664 | 97.77 |
| 44333.270833333336 | 93.14 |
| 44333.28125 | 169.62 |
| 44333.291666666664 | 258.56 |
| 44333.302083333336 | 300.93 |
| 44333.3125 | 336.28 |
| 44333.322916666664 | 207.86 |
| 44333.333333333336 | 154.19 |
| 44333.34375 | 139.31 |
| 44333.354166666664 | 147.58 |
| 44333.364583333336 | 165.03 |
| 44333.375 | 309.35 |
| 44333.385416666664 | 380.44 |
| 44333.395833333336 | 329.52 |
| 44333.40625 | 292.5 |
| 44333.416666666664 | 149.48 |
| 44333.427083333336 | 264.01 |
| 44333.4375 | 165.57 |
| 44333.447916666664 | 205.41 |
| 44333.458333333336 | 247.87 |
| 44333.46875 | 111.62 |
| 44333.479166666664 | 214.55 |
| 44333.489583333336 | 103.82 |
| 44333.5 | 224.49 |
| 44333.510416666664 | 133.62 |
| 44333.520833333336 | 111.35 |
| 44333.53125 | 145.99 |
| 44333.541666666664 | 83.44 |
| 44333.552083333336 | 188.68 |
| 44333.5625 | 251.58 |
| 44333.572916666664 | 185.88 |
| 44333.583333333336 | 268.53 |
| 44333.59375 | 134.82 |
| 44333.604166666664 | 83.38 |
| 44333.614583333336 | 199.07 |
| 44333.625 | 264.77 |
| 44333.635416666664 | 193.18 |
| 44333.645833333336 | 247.28 |
| 44333.65625 | 238.6 |
| 44333.666666666664 | 79.76 |
| 44333.677083333336 | 221.73 |
| 44333.6875 | 199.44 |
| 44333.697916666664 | 94.64 |
| 44333.708333333336 | 76.58 |
| 44333.71875 | 207.02 |
| 44333.729166666664 | 144.73 |
| 44333.739583333336 | 187.66 |
| 44333.75 | 89.26 |
| 44333.760416666664 | 121.21 |
| 44333.770833333336 | 109.13 |
| 44333.78125 | 193.41 |
| 44333.791666666664 | 185.95 |
| 44333.802083333336 | 192.16 |
| 44333.8125 | 171.6 |
| 44333.822916666664 | 161.13 |
| 44333.833333333336 | 147.91 |
| 44333.84375 | 170.12 |
| 44333.854166666664 | 168.08 |
| 44333.864583333336 | 167.43 |
| 44333.875 | 197.48 |
| 44333.885416666664 | 235.42 |
| 44333.895833333336 | 141.81 |
| 44333.90625 | 204.11 |
| 44333.916666666664 | 179.38 |
| 44333.927083333336 | 247.81 |
| 44333.9375 | 236.71 |
| 44333.947916666664 | 173.33 |
| 44333.958333333336 | 178.35 |
| 44333.96875 | 145.78 |
| 44333.979166666664 | 209.7 |
| 44333.989583333336 | 345.85 |
| 44334.0 | 197.23 |
| 44334.010416666664 | 212.36 |
| 44334.020833333336 | 216.01 |
| 44334.03125 | 234.82 |
| 44334.041666666664 | 219.9 |
| 44334.052083333336 | 247.86 |
| 44334.0625 | 209.01 |
| 44334.072916666664 | 226.26 |
| 44334.083333333336 | 244.64 |
| 44334.09375 | 260.09 |
| 44334.104166666664 | 221.53 |
| 44334.114583333336 | 199.34 |
| 44334.125 | 247.47 |
| 44334.135416666664 | 217.13 |
| 44334.145833333336 | 199.62 |
| 44334.15625 | 238.39 |
| 44334.166666666664 | 184.17 |
| 44334.177083333336 | 198.14 |
| 44334.1875 | 166.82 |
| 44334.197916666664 | 203.46 |
| 44334.208333333336 | 298.05 |
| 44334.21875 | 166.84 |
| 44334.229166666664 | 152.74 |
| 44334.239583333336 | 137.32 |
| 44334.25 | 111.37 |
| 44334.260416666664 | 160.01 |
| 44334.270833333336 | 146.07 |
| 44334.28125 | 184.57 |
| 44334.291666666664 | 239.09 |
| 44334.302083333336 | 155.52 |
| 44334.3125 | 235.38 |
| 44334.322916666664 | 304.41 |
| 44334.333333333336 | 217.2 |
| 44334.34375 | 202.68 |
| 44334.354166666664 | 195.71 |
| 44334.364583333336 | 224.56 |
| 44334.375 | 216.63 |
| 44334.385416666664 | 213.79 |
| 44334.395833333336 | 193.51 |
| 44334.40625 | 183.2 |
| 44334.416666666664 | 225.17 |
| 44334.427083333336 | 219.79 |
| 44334.4375 | 248.01 |
| 44334.447916666664 | 176.78 |
| 44334.458333333336 | 169.91 |
| 44334.46875 | 214.04 |
| 44334.479166666664 | 181.32 |
| 44334.489583333336 | 214.16 |
| 44334.5 | 196.62 |
| 44334.510416666664 | 206.21 |
| 44334.520833333336 | 311.85 |
| 44334.53125 | 176.51 |
| 44334.541666666664 | 246.24 |
| 44334.552083333336 | 14.42 |
| 44334.5625 | 15.43 |
| 44334.572916666664 | 15.24 |
| 44334.583333333336 | 16.15 |
| 44334.59375 | 16.73 |
| 44334.604166666664 | 15.85 |
| 44334.614583333336 | 16.44 |
| 44334.625 | 15.54 |
| 44334.635416666664 | 13.82 |
| 44334.645833333336 | 14.98 |
| 44334.65625 | 14.36 |
| 44334.666666666664 | 14.73 |
| 44334.677083333336 | 14.55 |
| 44334.6875 | 14.62 |
| 44334.697916666664 | 13.04 |
| 44334.708333333336 | 12.06 |
| 44334.71875 | 10.44 |
| 44334.729166666664 | 10.8 |
| 44334.739583333336 | 10.31 |
| 44334.75 | 11.4 |
| 44334.760416666664 | 10.08 |
| 44334.770833333336 | 9.74 |
| 44334.78125 | 9.35 |
| 44334.791666666664 | 16 |
| 44334.802083333336 | 13.82 |
| 44334.8125 | 14.81 |
| 44334.822916666664 | 13.28 |
| 44334.833333333336 | 13.81 |
| 44334.84375 | 12.68 |
| 44334.854166666664 | 13.79 |
| 44334.864583333336 | 13.8 |
| 44334.875 | 15.2 |
| 44334.885416666664 | 13.91 |
| 44334.895833333336 | 14.05 |
| 44334.90625 | 14.82 |
| 44334.916666666664 | 15.52 |
| 44334.927083333336 | 14.75 |
| 44334.9375 | 14.57 |
| 44334.947916666664 | 15.27 |
| 44334.958333333336 | 13.68 |
| 44334.96875 | 13.34 |
| 44334.979166666664 | 12.52 |
| 44334.989583333336 | 13.15 |
| 44335.0 | 12.27 |
| 44335.010416666664 | 12.29 |
| 44335.020833333336 | 13.12 |
| 44335.03125 | 14.34 |
| 44335.041666666664 | 16.39 |
| 44335.052083333336 | 15.8 |
| 44335.0625 | 17.42 |
| 44335.072916666664 | 17.09 |
| 44335.083333333336 | 18.33 |
| 44335.09375 | 18.69 |
| 44335.104166666664 | 19.85 |
| 44335.114583333336 | 19.01 |
| 44335.125 | 18.59 |
| 44335.135416666664 | 16.91 |
| 44335.145833333336 | 16.97 |
| 44335.15625 | 15.79 |
| 44335.166666666664 | 16.1 |
| 44335.177083333336 | 15.63 |
| 44335.1875 | 13.31 |
| 44335.197916666664 | 12.6 |
| 44335.208333333336 | 14.98 |
| 44335.21875 | 14.12 |
| 44335.229166666664 | 13.24 |
| 44335.239583333336 | 12.19 |
| 44335.25 | 12.91 |
| 44335.260416666664 | 10.69 |
| 44335.270833333336 | 10.59 |
| 44335.28125 | 11.29 |
| 44335.291666666664 | 12.57 |
| 44335.302083333336 | 11.08 |
| 44335.3125 | 11.22 |
| 44335.322916666664 | 9.86 |
| 44335.333333333336 | 10.67 |
| 44335.34375 | 12.85 |
| 44335.354166666664 | 13.92 |
| 44335.364583333336 | 18.45 |
| 44335.375 | 17.79 |
| 44335.385416666664 | 17.52 |
| 44335.395833333336 | 20.68 |
| 44335.40625 | 20.27 |
| 44335.416666666664 | 19.67 |
| 44335.427083333336 | 16.7 |
| 44335.4375 | 15.98 |
| 44335.447916666664 | 17.47 |
| 44335.458333333336 | 16.39 |
| 44335.46875 | 14.71 |
| 44335.479166666664 | 14.68 |
| 44335.489583333336 | 16.97 |
| 44335.5 | 16.09 |
| 44335.510416666664 | 14.91 |
| 44335.520833333336 | 16.33 |
| 44335.53125 | 20.89 |
| 44335.541666666664 | 14.58 |
| 44335.552083333336 | 12.76 |
| 44335.5625 | 17.03 |
| 44335.572916666664 | 17.36 |
| 44335.583333333336 | 17.85 |
| 44335.59375 | 19.62 |
| 44335.604166666664 | 18.13 |
| 44335.614583333336 | 16.5 |
| 44335.625 | 18.22 |
| 44335.635416666664 | 18.74 |
| 44335.645833333336 | 18.91 |
| 44335.65625 | 18.33 |
| 44335.666666666664 | 17.67 |
| 44335.677083333336 | 15.91 |
| 44335.6875 | 15.37 |
| 44335.697916666664 | 14.75 |
| 44335.708333333336 | 15.15 |
| 44335.71875 | 13.85 |
| 44335.729166666664 | 14.86 |
| 44335.739583333336 | 14.21 |
| 44335.75 | 15.59 |
| 44335.760416666664 | 13.92 |
| 44335.770833333336 | 14.82 |
| 44335.78125 | 14.04 |
| 44335.791666666664 | 13.61 |
| 44335.802083333336 | 13.46 |
| 44335.8125 | 9.7 |
| 44335.822916666664 | 10.89 |
| 44335.833333333336 | 11.36 |
| 44335.84375 | 13.98 |
| 44335.854166666664 | 14.2 |
| 44335.864583333336 | 14.68 |
| 44335.875 | 13.76 |
| 44335.885416666664 | 15.23 |
| 44335.895833333336 | 17.02 |
| 44335.90625 | 19.23 |
| 44335.916666666664 | 18.04 |
| 44335.927083333336 | 16.6 |
| 44335.9375 | 16.24 |
| 44335.947916666664 | 14.98 |
| 44335.958333333336 | 15.58 |
| 44335.96875 | 15.06 |
| 44335.979166666664 | 14.57 |
| 44335.989583333336 | 14.94 |
| 44336.0 | 13.67 |
| 44336.010416666664 | 14.03 |
| 44336.020833333336 | 14.05 |
| 44336.03125 | 15.08 |
| 44336.041666666664 | 14.53 |
| 44336.052083333336 | 12.89 |
| 44336.0625 | 13.08 |
| 44336.072916666664 | 15.26 |
| 44336.083333333336 | 15.26 |
| 44336.09375 | 15.17 |
| 44336.104166666664 | 16.27 |
| 44336.114583333336 | 16.74 |
| 44336.125 | 17.54 |
| 44336.135416666664 | 16.54 |
| 44336.145833333336 | 17.57 |
| 44336.15625 | 16.85 |
| 44336.166666666664 | 17.65 |
| 44336.177083333336 | 17.97 |
| 44336.1875 | 18.01 |
| 44336.197916666664 | 17.72 |
| 44336.208333333336 | 17.11 |
| 44336.21875 | 18.35 |
| 44336.229166666664 | 17.63 |
| 44336.239583333336 | 17.07 |
| 44336.25 | 16.03 |
| 44336.260416666664 | 14.82 |
| 44336.270833333336 | 14.62 |
| 44336.28125 | 13.16 |
| 44336.291666666664 | 13.41 |
| 44336.302083333336 | 12.32 |
| 44336.3125 | 10.9 |
| 44336.322916666664 | 11.22 |
| 44336.333333333336 | 10.55 |
| 44336.34375 | 9.94 |
| 44336.354166666664 | 10.09 |
| 44336.364583333336 | 10.96 |
| 44336.375 | 11.75 |
| 44336.385416666664 | 12.33 |
| 44336.395833333336 | 11.28 |
| 44336.40625 | 13.38 |
| 44336.416666666664 | 14.65 |
| 44336.427083333336 | 12.77 |
| 44336.4375 | 15.62 |
| 44336.447916666664 | 18.34 |
| 44336.458333333336 | 17.83 |
| 44336.46875 | 18.79 |
| 44336.479166666664 | 17.06 |
| 44336.489583333336 | 17.36 |
| 44336.5 | 18.86 |
| 44336.510416666664 | 17.16 |
| 44336.520833333336 | 15.84 |
| 44336.53125 | 15.79 |
| 44336.541666666664 | 14.67 |
| 44336.552083333336 | 14.18 |
| 44336.5625 | 14.24 |
| 44336.572916666664 | 18.24 |
| 44336.583333333336 | 13.71 |
| 44336.59375 | 13.88 |
| 44336.604166666664 | 17.13 |
| 44336.614583333336 | 18.19 |
| 44336.625 | 17.64 |
| 44336.635416666664 | 16.09 |
| 44336.645833333336 | 16.15 |
| 44336.65625 | 15.91 |
| 44336.666666666664 | 15.91 |
| 44336.677083333336 | 16.36 |
| 44336.6875 | 16.02 |
| 44336.697916666664 | 16.68 |
| 44336.708333333336 | 16.22 |
| 44336.71875 | 15.39 |
| 44336.729166666664 | 14.65 |
| 44336.739583333336 | 16.56 |
| 44336.75 | 16.37 |
| 44336.760416666664 | 16.72 |
| 44336.770833333336 | 16.34 |
| 44336.78125 | 16.17 |
| 44336.791666666664 | 15.91 |
| 44336.802083333336 | 15.7 |
| 44336.8125 | 14.87 |
| 44336.822916666664 | 12.16 |
| 44336.833333333336 | 11.77 |
| 44336.84375 | 10.65 |
| 44336.854166666664 | 9.77 |
| 44336.864583333336 | 12.75 |
| 44336.875 | 14.28 |
| 44336.885416666664 | 16.15 |
| 44336.895833333336 | 17.03 |
| 44336.90625 | 18.73 |
| 44336.916666666664 | 20.42 |
| 44336.927083333336 | 20.02 |
| 44336.9375 | 19.94 |
| 44336.947916666664 | 20.17 |
| 44336.958333333336 | 27.46 |
| 44336.96875 | 20.81 |
| 44336.979166666664 | 22.26 |
| 44336.989583333336 | 22.13 |
| 44337.0 | 22.9 |
| 44337.010416666664 | 23.99 |
| 44337.020833333336 | 23.29 |
| 44337.03125 | 20.82 |
| 44337.041666666664 | 20.75 |
| 44337.052083333336 | 19.35 |
| 44337.0625 | 17.48 |
| 44337.072916666664 | 17.32 |
| 44337.083333333336 | 14.98 |
| 44337.09375 | 13.59 |
| 44337.104166666664 | 14.04 |
| 44337.114583333336 | 14.01 |
| 44337.125 | 14.24 |
| 44337.135416666664 | 16.73 |
| 44337.145833333336 | 16.19 |
| 44337.15625 | 16.45 |
| 44337.166666666664 | 17.41 |
| 44337.177083333336 | 18.03 |
| 44337.1875 | 18.37 |
| 44337.197916666664 | 19.47 |
| 44337.208333333336 | 19.91 |
| 44337.21875 | 19.14 |
| 44337.229166666664 | 16.64 |
| 44337.239583333336 | 19.24 |
| 44337.25 | 17.58 |
| 44337.260416666664 | 18.84 |
| 44337.270833333336 | 16.99 |
| 44337.28125 | 17 |
| 44337.291666666664 | 16.05 |
| 44337.302083333336 | 15.98 |
| 44337.3125 | 14.64 |
| 44337.322916666664 | 13.63 |
| 44337.333333333336 | 11.42 |
| 44337.34375 | 11.66 |
| 44337.354166666664 | 11.13 |
| 44337.364583333336 | 10 |
| 44337.375 | 12.59 |
| 44337.385416666664 | 10.69 |
| 44337.395833333336 | 9.56 |
| 44337.40625 | 10.27 |
| 44337.416666666664 | 11.52 |
| 44337.427083333336 | 13.71 |
| 44337.4375 | 13.05 |
| 44337.447916666664 | 14.62 |
| 44337.458333333336 | 14.14 |
| 44337.46875 | 14.89 |
| 44337.479166666664 | 18.38 |
| 44337.489583333336 | 21.66 |
| 44337.5 | 21.6 |
| 44337.510416666664 | 22.74 |
| 44337.520833333336 | 22.26 |
| 44337.53125 | 22.41 |
| 44337.541666666664 | 23.69 |
| 44337.552083333336 | 21.85 |
| 44337.5625 | 20.39 |
| 44337.572916666664 | 18.77 |
| 44337.583333333336 | 18.28 |
| 44337.59375 | 17.1 |
| 44337.604166666664 | 15.73 |
| 44337.614583333336 | 14.24 |
| 44337.625 | 14.35 |
| 44337.635416666664 | 13.41 |
| 44337.645833333336 | 17.35 |
| 44337.65625 | 18.41 |
| 44337.666666666664 | 18.31 |
| 44337.677083333336 | 18.27 |
| 44337.6875 | 17.34 |
| 44337.697916666664 | 17.2 |
| 44337.708333333336 | 16.88 |
| 44337.71875 | 16.1 |
| 44337.729166666664 | 17.62 |
| 44337.739583333336 | 17.34 |
| 44337.75 | 19.77 |
| 44337.760416666664 | 17.38 |
| 44337.770833333336 | 19 |
| 44337.78125 | 19 |
| 44337.791666666664 | 17.63 |
| 44337.802083333336 | 17.25 |
| 44337.8125 | 16.32 |
| 44337.822916666664 | 17.57 |
| 44337.833333333336 | 14.97 |
| 44337.84375 | 16.81 |
| 44337.854166666664 | 14.85 |
| 44337.864583333336 | 14.51 |
| 44337.875 | 10.13 |
| 44337.885416666664 | 10.46 |
| 44337.895833333336 | 9.67 |
| 44337.90625 | 10.05 |
| 44337.916666666664 | 10.63 |
| 44337.927083333336 | 14.4 |
| 44337.9375 | 15.67 |
| 44337.947916666664 | 16.25 |
| 44337.958333333336 | 18.05 |
| 44337.96875 | 18.6 |
| 44337.979166666664 | 20.8 |
| 44337.989583333336 | 21.36 |
| 44338.0 | 22.64 |
| 44338.010416666664 | 23.33 |
| 44338.020833333336 | 24.42 |
| 44338.03125 | 23.67 |
| 44338.041666666664 | 24.46 |
| 44338.052083333336 | 22.24 |
| 44338.0625 | 24.53 |
| 44338.072916666664 | 20.39 |
| 44338.083333333336 | 18.66 |
| 44338.09375 | 17.26 |
| 44338.104166666664 | 18.01 |
| 44338.114583333336 | 17.5 |
| 44338.125 | 15.36 |
| 44338.135416666664 | 13.68 |
| 44338.145833333336 | 13.63 |
| 44338.15625 | 16.3 |
| 44338.166666666664 | 16.66 |
| 44338.177083333336 | 17.48 |
| 44338.1875 | 16.82 |
| 44338.197916666664 | 16.08 |
| 44338.208333333336 | 16.79 |
| 44338.21875 | 16.8 |
| 44338.229166666664 | 17.63 |
| 44338.239583333336 | 17.68 |
| 44338.25 | 17.01 |
| 44338.260416666664 | 16.87 |
| 44338.270833333336 | 20.43 |
| 44338.28125 | 17.08 |
| 44338.291666666664 | 17.4 |
| 44338.302083333336 | 17.28 |
| 44338.3125 | 15.98 |
| 44338.322916666664 | 17.21 |
| 44338.333333333336 | 13.52 |
| 44338.34375 | 18.03 |
| 44338.354166666664 | 15.58 |
| 44338.364583333336 | 15.58 |
| 44338.375 | 14.93 |
| 44338.385416666664 | 11.65 |
| 44338.395833333336 | 12.93 |
| 44338.40625 | 10.32 |
| 44338.416666666664 | 12.93 |
| 44338.427083333336 | 11.76 |
| 44338.4375 | 10.65 |
| 44338.447916666664 | 12.47 |
| 44338.458333333336 | 15.13 |
| 44338.46875 | 15.34 |
| 44338.479166666664 | 15.51 |
| 44338.489583333336 | 19.94 |
| 44338.5 | 17.25 |
| 44338.510416666664 | 25.09 |
| 44338.520833333336 | 20.27 |
| 44338.53125 | 24.06 |
| 44338.541666666664 | 20.47 |
| 44338.552083333336 | 22.22 |
| 44338.5625 | 21.5 |
| 44338.572916666664 | 22.08 |
| 44338.583333333336 | 21.23 |
| 44338.59375 | 22.52 |
| 44338.604166666664 | 25.12 |
| 44338.614583333336 | 21.2 |
| 44338.625 | 21.01 |
| 44338.635416666664 | 26.98 |
| 44338.645833333336 | 19.23 |
| 44338.65625 | 14.68 |
| 44338.666666666664 | 17.56 |
| 44338.677083333336 | 19.9 |
| 44338.6875 | 21.93 |
| 44338.697916666664 | 19.21 |
| 44338.708333333336 | 19.86 |
| 44338.71875 | 20.85 |
| 44338.729166666664 | 21.41 |
| 44338.739583333336 | 22.26 |
| 44338.75 | 21.25 |
| 44338.760416666664 | 22.29 |
| 44338.770833333336 | 21.48 |
| 44338.78125 | 19.19 |
| 44338.791666666664 | 19.31 |
| 44338.802083333336 | 21.21 |
| 44338.8125 | 21.42 |
| 44338.822916666664 | 24.83 |
| 44338.833333333336 | 23.77 |
| 44338.84375 | 24.88 |
| 44338.854166666664 | 21.09 |
| 44338.864583333336 | 20.77 |
| 44338.875 | 20.06 |
| 44338.885416666664 | 17.48 |
| 44338.895833333336 | 15.45 |
| 44338.90625 | 15.4 |
| 44338.916666666664 | 15.16 |
| 44338.927083333336 | 14.19 |
| 44338.9375 | 12.94 |
| 44338.947916666664 | 11.35 |
| 44338.958333333336 | 12.78 |
| 44338.96875 | 11.53 |
| 44338.979166666664 | 13.58 |
| 44338.989583333336 | 15.9 |
| 44339.0 | 18.1 |
| 44339.010416666664 | 20.47 |
| 44339.020833333336 | 21.81 |
| 44339.03125 | 23.89 |
| 44339.041666666664 | 28.44 |
| 44339.052083333336 | 23.24 |
| 44339.0625 | 28.96 |
| 44339.072916666664 | 29.92 |
| 44339.083333333336 | 26.26 |
| 44339.09375 | 26.42 |
| 44339.104166666664 | 23.12 |
| 44339.114583333336 | 21.81 |
| 44339.125 | 21.58 |
| 44339.135416666664 | 20.84 |
| 44339.145833333336 | 18.21 |
| 44339.15625 | 14.89 |
| 44339.166666666664 | 14.85 |
| 44339.177083333336 | 15.08 |
| 44339.1875 | 13.01 |
| 44339.197916666664 | 15.44 |
| 44339.208333333336 | 16.31 |
| 44339.21875 | 17.24 |
| 44339.229166666664 | 15.91 |
| 44339.239583333336 | 16.5 |
| 44339.25 | 17.71 |
| 44339.260416666664 | 18.12 |
| 44339.270833333336 | 18.2 |
| 44339.28125 | 19.6 |
| 44339.291666666664 | 18.78 |
| 44339.302083333336 | 19.28 |
| 44339.3125 | 18.89 |
| 44339.322916666664 | 17.87 |
| 44339.333333333336 | 20.57 |
| 44339.34375 | 20.04 |
| 44339.354166666664 | 21.51 |
| 44339.364583333336 | 17.05 |
| 44339.375 | 19.31 |
| 44339.385416666664 | 18.62 |
| 44339.395833333336 | 15.88 |
| 44339.40625 | 16.27 |
| 44339.416666666664 | 13.57 |
| 44339.427083333336 | 15.68 |
| 44339.4375 | 12.34 |
| 44339.447916666664 | 12.18 |
| 44339.458333333336 | 11.61 |
| 44339.46875 | 11.02 |
| 44339.479166666664 | 11.85 |
| 44339.489583333336 | 12.99 |
| 44339.5 | 13.66 |
| 44339.510416666664 | 12.97 |
| 44339.520833333336 | 17.66 |
| 44339.53125 | 16.09 |
| 44339.541666666664 | 14.91 |
| 44339.552083333336 | 18.48 |
| 44339.5625 | 24.04 |
| 44339.572916666664 | 24.33 |
| 44339.583333333336 | 20.2 |
| 44339.59375 | 20.52 |
| 44339.604166666664 | 25.01 |
| 44339.614583333336 | 24.33 |
| 44339.625 | 22.12 |
| 44339.635416666664 | 20.84 |
| 44339.645833333336 | 18.97 |
| 44339.65625 | 21.13 |
| 44339.666666666664 | 18.44 |
| 44339.677083333336 | 24.17 |
| 44339.6875 | 19.13 |
| 44339.697916666664 | 15.85 |
| 44339.708333333336 | 17.76 |
| 44339.71875 | 19.23 |
| 44339.729166666664 | 22.25 |
| 44339.739583333336 | 278.35 |
| 44339.75 | 20.4 |
| 44339.760416666664 | 23.93 |
| 44339.770833333336 | 26.79 |
| 44339.78125 | 24.41 |
| 44339.791666666664 | 25 |
| 44339.802083333336 | 23.29 |
| 44339.8125 | 22.92 |
| 44339.822916666664 | 24.09 |
| 44339.833333333336 | 25.68 |
| 44339.84375 | 26.6 |
| 44339.854166666664 | 23.1 |
| 44339.864583333336 | 27.27 |
| 44339.875 | 24.89 |
| 44339.885416666664 | 34.74 |
| 44339.895833333336 | 22.6 |
| 44339.90625 | 22.03 |
| 44339.916666666664 | 18.76 |
| 44339.927083333336 | 19.06 |
| 44339.9375 | 17.64 |
| 44339.947916666664 | 17.3 |
| 44339.958333333336 | 16.25 |
| 44339.96875 | 15.36 |
| 44339.979166666664 | 12.99 |
| 44339.989583333336 | 13.41 |
| 44340.0 | 11.32 |
| 44340.010416666664 | 11.84 |
| 44340.020833333336 | 13.72 |
| 44340.03125 | 19.84 |
| 44340.041666666664 | 21.53 |
| 44340.052083333336 | 28.58 |
| 44340.0625 | 21.76 |
| 44340.072916666664 | 19.93 |
| 44340.083333333336 | 24.12 |
| 44340.09375 | 27.34 |
| 44340.104166666664 | 22.87 |
| 44340.114583333336 | 28.43 |
| 44340.125 | 38.16 |
| 44340.135416666664 | 33.81 |
| 44340.145833333336 | 25.47 |
| 44340.15625 | 31.56 |
| 44340.166666666664 | 28.23 |
| 44340.177083333336 | 23.09 |
| 44340.1875 | 22.89 |
| 44340.197916666664 | 17.91 |
| 44340.208333333336 | 16.39 |
| 44340.21875 | 20.73 |
| 44340.229166666664 | 13.69 |
| 44340.239583333336 | 17.06 |
| 44340.25 | 17.76 |
| 44340.260416666664 | 18.02 |
| 44340.270833333336 | 17.08 |
| 44340.28125 | 18.01 |
| 44340.291666666664 | 18.87 |
| 44340.302083333336 | 19.91 |
| 44340.3125 | 19.95 |
| 44340.322916666664 | 19.79 |
| 44340.333333333336 | 19.02 |
| 44340.34375 | 18.75 |
| 44340.354166666664 | 21.46 |
| 44340.364583333336 | 22.74 |
| 44340.375 | 25.69 |
| 44340.385416666664 | 25.62 |
| 44340.395833333336 | 25.85 |
| 44340.40625 | 25.57 |
| 44340.416666666664 | 23.75 |
| 44340.427083333336 | 22.02 |
| 44340.4375 | 18.17 |
| 44340.447916666664 | 20.17 |
| 44340.458333333336 | 19.33 |
| 44340.46875 | 21.51 |
| 44340.479166666664 | 18.55 |
| 44340.489583333336 | 14.53 |
| 44340.5 | 13.94 |
| 44340.510416666664 | 14.5 |
| 44340.520833333336 | 15.34 |
| 44340.53125 | 15.91 |
| 44340.541666666664 | 16.14 |
| 44340.552083333336 | 16.89 |
| 44340.5625 | 17.58 |
| 44340.572916666664 | 20.29 |
| 44340.583333333336 | 21.89 |
| 44340.59375 | 21.66 |
| 44340.604166666664 | 26.3 |
| 44340.614583333336 | 32.03 |
| 44340.625 | 33.61 |
| 44340.635416666664 | 39.88 |
| 44340.645833333336 | 47.35 |
| 44340.65625 | 53.11 |
| 44340.666666666664 | 53.97 |
| 44340.677083333336 | 50.04 |
| 44340.6875 | 46.62 |
| 44340.697916666664 | 41.05 |
| 44340.708333333336 | 34.43 |
| 44340.71875 | 25.81 |
| 44340.729166666664 | 23.61 |
| 44340.739583333336 | 19.2 |
| 44340.75 | 22.91 |
| 44340.760416666664 | 28.87 |
| 44340.770833333336 | 25.02 |
| 44340.78125 | 21.47 |
| 44340.791666666664 | 21.63 |
| 44340.802083333336 | 22.52 |
| 44340.8125 | 23.05 |
| 44340.822916666664 | 25.79 |
| 44340.833333333336 | 27.83 |
| 44340.84375 | 30.69 |
| 44340.854166666664 | 31.41 |
| 44340.864583333336 | 33.91 |
| 44340.875 | 35.74 |
| 44340.885416666664 | 35.84 |
| 44340.895833333336 | 36.41 |
| 44340.90625 | 33.46 |
| 44340.916666666664 | 30 |
| 44340.927083333336 | 27.41 |
| 44340.9375 | 25.81 |
| 44340.947916666664 | 21.33 |
| 44340.958333333336 | 21.88 |
| 44340.96875 | 19.77 |
| 44340.979166666664 | 17.61 |
| 44340.989583333336 | 16.86 |
| 44341.0 | 16.18 |
| 44341.010416666664 | 15.19 |
| 44341.020833333336 | 14.55 |
| 44341.03125 | 12.42 |
| 44341.041666666664 | 12.6 |
| 44341.052083333336 | 13.18 |
| 44341.0625 | 12.89 |
| 44341.072916666664 | 14.07 |
| 44341.083333333336 | 14.45 |
| 44341.09375 | 17.09 |
| 44341.104166666664 | 16.45 |
| 44341.114583333336 | 17.62 |
| 44341.125 | 18.02 |
| 44341.135416666664 | 22.45 |
| 44341.145833333336 | 24.23 |
| 44341.15625 | 30.15 |
| 44341.166666666664 | 34.89 |
| 44341.177083333336 | 45.7 |
| 44341.1875 | 52.98 |
| 44341.197916666664 | 57.69 |
| 44341.208333333336 | 56.01 |
| 44341.21875 | 41.53 |
| 44341.229166666664 | 43.89 |
| 44341.239583333336 | 38.58 |
| 44341.25 | 30 |
| 44341.260416666664 | 26.7 |
| 44341.270833333336 | 22.36 |
| 44341.28125 | 333.97 |
| 44341.291666666664 | 17.98 |
| 44341.302083333336 | 20.04 |
| 44341.3125 | 17.78 |
| 44341.322916666664 | 17.72 |
| 44341.333333333336 | 18.77 |
| 44341.34375 | 19.09 |
| 44341.354166666664 | 19.04 |
| 44341.364583333336 | 20.59 |
| 44341.375 | 22.07 |
| 44341.385416666664 | 24.4 |
| 44341.395833333336 | 25.29 |
| 44341.40625 | 26.75 |
| 44341.416666666664 | 26.93 |
| 44341.427083333336 | 26.79 |
| 44341.4375 | 26.03 |
| 44341.447916666664 | 24.58 |
| 44341.458333333336 | 23.54 |
| 44341.46875 | 21.82 |
| 44341.479166666664 | 18.99 |
| 44341.489583333336 | 18.42 |
| 44341.5 | 16.94 |
| 44341.510416666664 | 15.49 |
| 44341.520833333336 | 14.23 |
| 44341.53125 | 12.78 |
| 44341.541666666664 | 13.24 |
| 44341.552083333336 | 13.08 |
| 44341.5625 | 11.45 |
| 44341.572916666664 | 13.31 |
| 44341.583333333336 | 15.35 |
| 44341.59375 | 16.98 |
| 44341.604166666664 | 19.31 |
| 44341.614583333336 | 19.33 |
| 44341.625 | 20.3 |
| 44341.635416666664 | 23.52 |
| 44341.645833333336 | 25.27 |
| 44341.65625 | 27.46 |
| 44341.666666666664 | 27.9 |
| 44341.677083333336 | 28.6 |
| 44341.6875 | 23.15 |
| 44341.697916666664 | 23.22 |
| 44341.708333333336 | 22.64 |
| 44341.71875 | 20.52 |
| 44341.729166666664 | 23.02 |
| 44341.739583333336 | 20.46 |
| 44341.75 | 19.02 |
| 44341.760416666664 | 21.56 |
| 44341.770833333336 | 17.07 |
| 44341.78125 | 15.04 |
| 44341.791666666664 | 19.27 |
| 44341.802083333336 | 20.5 |
| 44341.8125 | 19.91 |
| 44341.822916666664 | 20.52 |
| 44341.833333333336 | 21.91 |
| 44341.84375 | 21.31 |
| 44341.854166666664 | 15.45 |
| 44341.864583333336 | 20.15 |
| 44341.875 | 19.06 |
| 44341.885416666664 | 20.97 |
| 44341.895833333336 | 23.65 |
| 44341.90625 | 25.05 |
| 44341.916666666664 | 26.13 |
| 44341.927083333336 | 24.94 |
| 44341.9375 | 25.99 |
| 44341.947916666664 | 26.11 |
| 44341.958333333336 | 24.2 |
| 44341.96875 | 23.01 |
| 44341.979166666664 | 20.13 |
| 44341.989583333336 | 20.27 |
| 44342.0 | 17.96 |
| 44342.010416666664 | 16.2 |
| 44342.020833333336 | 17.21 |
| 44342.03125 | 15.29 |
| 44342.041666666664 | 48.33 |
| 44342.052083333336 | 12.29 |
| 44342.0625 | 13.28 |
| 44342.072916666664 | 12.79 |
| 44342.083333333336 | 11.36 |
| 44342.09375 | 12.65 |
| 44342.104166666664 | 13.56 |
| 44342.114583333336 | 14.36 |
| 44342.125 | 13.35 |
| 44342.135416666664 | 16.14 |
| 44342.145833333336 | 18.08 |
| 44342.15625 | 17.27 |
| 44342.166666666664 | 19.66 |
| 44342.177083333336 | 23.49 |
| 44342.1875 | 25.94 |
| 44342.197916666664 | 26.85 |
| 44342.208333333336 | 35.36 |
| 44342.21875 | 31.68 |
| 44342.229166666664 | 27.88 |
| 44342.239583333336 | 31.23 |
| 44342.25 | 32.85 |
| 44342.260416666664 | 29.56 |
| 44342.270833333336 | 32.57 |
| 44342.28125 | 28.65 |
| 44342.291666666664 | 22.95 |
| 44342.302083333336 | 23.46 |
| 44342.3125 | 18.51 |
| 44342.322916666664 | 18.05 |
| 44342.333333333336 | 18.91 |
| 44342.34375 | 20.91 |
| 44342.354166666664 | 19.46 |
| 44342.364583333336 | 18.51 |
| 44342.375 | 22.3 |
| 44342.385416666664 | 24.86 |
| 44342.395833333336 | 26.04 |
| 44342.40625 | 25.7 |
| 44342.416666666664 | 26.17 |
| 44342.427083333336 | 24.4 |
| 44342.4375 | 30.01 |
| 44342.447916666664 | 31.14 |
| 44342.458333333336 | 31.17 |
| 44342.46875 | 29.97 |
| 44342.479166666664 | 28.03 |
| 44342.489583333336 | 28.15 |
| 44342.5 | 29.14 |
| 44342.510416666664 | 26.42 |
| 44342.520833333336 | 23.77 |
| 44342.53125 | 22 |
| 44342.541666666664 | 19.03 |
| 44342.552083333336 | 17.73 |
| 44342.5625 | 16.01 |
| 44342.572916666664 | 14.53 |
| 44342.583333333336 | 14.99 |
| 44342.59375 | 17.33 |
| 44342.604166666664 | 18.01 |
| 44342.614583333336 | 21.09 |
| 44342.625 | 20.25 |
| 44342.635416666664 | 19.1 |
| 44342.645833333336 | 20.52 |
| 44342.65625 | 22.1 |
| 44342.666666666664 | 26.36 |
| 44342.677083333336 | 27.05 |
| 44342.6875 | 25.61 |
| 44342.697916666664 | 26.96 |
| 44342.708333333336 | 25.11 |
| 44342.71875 | 26.21 |
| 44342.729166666664 | 28.44 |
| 44342.739583333336 | 26.6 |
| 44342.75 | 28.81 |
| 44342.760416666664 | 31.37 |
| 44342.770833333336 | 34.36 |
| 44342.78125 | 31.76 |
| 44342.791666666664 | 35.15 |
| 44342.802083333336 | 32.18 |
| 44342.8125 | 25.96 |
| 44342.822916666664 | 27.58 |
| 44342.833333333336 | 35.57 |
| 44342.84375 | 30.92 |
| 44342.854166666664 | 30.57 |
| 44342.864583333336 | 29.81 |
| 44342.875 | 32.64 |
| 44342.885416666664 | 31.38 |
| 44342.895833333336 | 37.27 |
| 44342.90625 | 37.53 |
| 44342.916666666664 | 39.91 |
| 44342.927083333336 | 40.98 |
| 44342.9375 | 46.73 |
| 44342.947916666664 | 51.02 |
| 44342.958333333336 | 50.69 |
| 44342.96875 | 51.02 |
| 44342.979166666664 | 48.57 |
| 44342.989583333336 | 48.49 |
| 44343.0 | 44.19 |
| 44343.010416666664 | 38.57 |
| 44343.020833333336 | 36.27 |
| 44343.03125 | 30.45 |
| 44343.041666666664 | 26.89 |
| 44343.052083333336 | 23.61 |
| 44343.0625 | 19.66 |
| 44343.072916666664 | 20.44 |
| 44343.083333333336 | 13.43 |
| 44343.09375 | 17.47 |
| 44343.104166666664 | 14.74 |
| 44343.114583333336 | 13.52 |
| 44343.125 | 13.49 |
| 44343.135416666664 | 15.65 |
| 44343.145833333336 | 13.68 |
| 44343.15625 | 14.56 |
| 44343.166666666664 | 14.51 |
| 44343.177083333336 | 14.51 |
| 44343.1875 | 21.3 |
| 44343.197916666664 | 20.58 |
| 44343.208333333336 | 29.82 |
| 44343.21875 | 36.78 |
| 44343.229166666664 | 42.12 |
| 44343.239583333336 | 49.91 |
| 44343.25 | 50.03 |
| 44343.260416666664 | 47.76 |
| 44343.270833333336 | 43.39 |
| 44343.28125 | 36.3 |
| 44343.291666666664 | 36.51 |
| 44343.302083333336 | 35.44 |
| 44343.3125 | 32.13 |
| 44343.322916666664 | 28.73 |
| 44343.333333333336 | 31.18 |
| 44343.34375 | 27.78 |
| 44343.354166666664 | 25.4 |
| 44343.364583333336 | 19.94 |
| 44343.375 | 23 |
| 44343.385416666664 | 25.48 |
| 44343.395833333336 | 23.9 |
| 44343.40625 | 27.14 |
| 44343.416666666664 | 34.87 |
| 44343.427083333336 | 40.15 |
| 44343.4375 | 41.96 |
| 44343.447916666664 | 37.87 |
| 44343.458333333336 | 35.33 |
| 44343.46875 | 32.77 |
| 44343.479166666664 | 33.24 |
| 44343.489583333336 | 33.75 |
| 44343.5 | 34.9 |
| 44343.510416666664 | 33.9 |
| 44343.520833333336 | 32.62 |
| 44343.53125 | 30.9 |
| 44343.541666666664 | 28.33 |
| 44343.552083333336 | 23.71 |
| 44343.5625 | 23.16 |
| 44343.572916666664 | 18.6 |
| 44343.583333333336 | 15.05 |
| 44343.59375 | 18.66 |
| 44343.604166666664 | 14.87 |
| 44343.614583333336 | 15.17 |
| 44343.625 | 15.74 |
| 44343.635416666664 | 16.07 |
| 44343.645833333336 | 20.01 |
| 44343.65625 | 20.36 |
| 44343.666666666664 | 20.71 |
| 44343.677083333336 | 21.07 |
| 44343.6875 | 22.22 |
| 44343.697916666664 | 27.81 |
| 44343.708333333336 | 30.96 |
| 44343.71875 | 30.22 |
| 44343.729166666664 | 34.32 |
| 44343.739583333336 | 36.76 |
| 44343.75 | 29.56 |
| 44343.760416666664 | 29.72 |
| 44343.770833333336 | 25.46 |
| 44343.78125 | 26.56 |
| 44343.791666666664 | 24.67 |
| 44343.802083333336 | 23.78 |
| 44343.8125 | 21 |
| 44343.822916666664 | 23.77 |
| 44343.833333333336 | 20.29 |
| 44343.84375 | 15.34 |
| 44343.854166666664 | 20.74 |
| 44343.864583333336 | 25.13 |
| 44343.875 | 26.94 |
| 44343.885416666664 | 27.49 |
| 44343.895833333336 | 31.52 |
| 44343.90625 | 29.6 |
| 44343.916666666664 | 29.66 |
| 44343.927083333336 | 29.96 |
| 44343.9375 | 30.12 |
| 44343.947916666664 | 26.97 |
| 44343.958333333336 | 28.16 |
| 44343.96875 | 31.97 |
| 44343.979166666664 | 32.92 |
| 44343.989583333336 | 33.95 |
| 44344.0 | 36.25 |
| 44344.010416666664 | 35.13 |
| 44344.020833333336 | 36.77 |
| 44344.03125 | 33.43 |
| 44344.041666666664 | 30.68 |
| 44344.052083333336 | 27.88 |
| 44344.0625 | 24.38 |
| 44344.072916666664 | 22.62 |
| 44344.083333333336 | 20.02 |
| 44344.09375 | 16.03 |
| 44344.104166666664 | 17.28 |
| 44344.114583333336 | 14.74 |
| 44344.125 | 13.83 |
| 44344.135416666664 | 14.2 |
| 44344.145833333336 | 14.16 |
| 44344.15625 | 13.32 |
| 44344.166666666664 | 14.35 |
| 44344.177083333336 | 12.94 |
| 44344.1875 | 15.63 |
| 44344.197916666664 | 14.65 |
| 44344.208333333336 | 15.24 |
| 44344.21875 | 13.86 |
| 44344.229166666664 | 18.86 |
| 44344.239583333336 | 28.9 |
| 44344.25 | 22.15 |
| 44344.260416666664 | 29.08 |
| 44344.270833333336 | 34.75 |
| 44344.28125 | 39.29 |
| 44344.291666666664 | 46.75 |
| 44344.302083333336 | 43.69 |
| 44344.3125 | 41.24 |
| 44344.322916666664 | 37.55 |
| 44344.333333333336 | 32.21 |
| 44344.34375 | 26.46 |
| 44344.354166666664 | 23.59 |
| 44344.364583333336 | 20.46 |
| 44344.375 | 17.32 |
| 44344.385416666664 | 16.29 |
| 44344.395833333336 | 17.01 |
| 44344.40625 | 23.06 |
| 44344.416666666664 | 21.87 |
| 44344.427083333336 | 22.98 |
| 44344.4375 | 22.34 |
| 44344.447916666664 | 26.47 |
| 44344.458333333336 | 28.51 |
| 44344.46875 | 27.45 |
| 44344.479166666664 | 27.58 |
| 44344.489583333336 | 31.49 |
| 44344.5 | 30.64 |
| 44344.510416666664 | 28.67 |
| 44344.520833333336 | 29.7 |
| 44344.53125 | 28.86 |
| 44344.541666666664 | 28.43 |
| 44344.552083333336 | 30.08 |
| 44344.5625 | 25.85 |
| 44344.572916666664 | 25.04 |
| 44344.583333333336 | 24.51 |
| 44344.59375 | 24.31 |
| 44344.604166666664 | 21.63 |
| 44344.614583333336 | 18.55 |
| 44344.625 | 17.38 |
| 44344.635416666664 | 15.92 |
| 44344.645833333336 | 14.31 |
| 44344.65625 | 12.97 |
| 44344.666666666664 | 16.94 |
| 44344.677083333336 | 16.41 |
| 44344.6875 | 17.71 |
| 44344.697916666664 | 19.43 |
| 44344.708333333336 | 21.78 |
| 44344.71875 | 19.57 |
| 44344.729166666664 | 20.93 |
| 44344.739583333336 | 21.51 |
| 44344.75 | 22.01 |
| 44344.760416666664 | 24.23 |
| 44344.770833333336 | 28.7 |
| 44344.78125 | 28.42 |
| 44344.791666666664 | 28.83 |
| 44344.802083333336 | 27.38 |
| 44344.8125 | 27.88 |
| 44344.822916666664 | 25.25 |
| 44344.833333333336 | 22.93 |
| 44344.84375 | 20.44 |
| 44344.854166666664 | 18.3 |
| 44344.864583333336 | 16.02 |
| 44344.875 | 13.9 |
| 44344.885416666664 | 16.47 |
| 44344.895833333336 | 18.06 |
| 44344.90625 | 20.48 |
| 44344.916666666664 | 22.49 |
| 44344.927083333336 | 23.14 |
| 44344.9375 | 24.52 |
| 44344.947916666664 | 26.82 |
| 44344.958333333336 | 29.34 |
| 44344.96875 | 32.54 |
| 44344.979166666664 | 34.32 |
| 44344.989583333336 | 34.1 |
| 44345.0 | 37.19 |
| 44345.010416666664 | 37.52 |
| 44345.020833333336 | 37.22 |
| 44345.03125 | 35.78 |
| 44345.041666666664 | 35.24 |
| 44345.052083333336 | 36.45 |
| 44345.0625 | 34.1 |
| 44345.072916666664 | 32.78 |
| 44345.083333333336 | 31.7 |
| 44345.09375 | 28.07 |
| 44345.104166666664 | 24.1 |
| 44345.114583333336 | 24.76 |
| 44345.125 | 19.28 |
| 44345.135416666664 | 21.45 |
| 44345.145833333336 | 16.22 |
| 44345.15625 | 15.67 |
| 44345.166666666664 | 12.37 |
| 44345.177083333336 | 13.51 |
| 44345.1875 | 12.44 |
| 44345.197916666664 | 12.03 |
| 44345.208333333336 | 11.82 |
| 44345.21875 | 11.88 |
| 44345.229166666664 | 13.36 |
| 44345.239583333336 | 12.76 |
| 44345.25 | 14.17 |
| 44345.260416666664 | 14.52 |
| 44345.270833333336 | 16.75 |
| 44345.28125 | 13.96 |
| 44345.291666666664 | 17.61 |
| 44345.302083333336 | 18.52 |
| 44345.3125 | 23.13 |
| 44345.322916666664 | 23.08 |
| 44345.333333333336 | 23.64 |
| 44345.34375 | 38.36 |
| 44345.354166666664 | 33.56 |
| 44345.364583333336 | 38.02 |
| 44345.375 | 40.83 |
| 44345.385416666664 | 38.6 |
| 44345.395833333336 | 26.72 |
| 44345.40625 | 23.35 |
| 44345.416666666664 | 16.77 |
| 44345.427083333336 | 17 |
| 44345.4375 | 14.71 |
| 44345.447916666664 | 18.38 |
| 44345.458333333336 | 19.81 |
| 44345.46875 | 20.18 |
| 44345.479166666664 | 20.47 |
| 44345.489583333336 | 21.36 |
| 44345.5 | 24.34 |
| 44345.510416666664 | 24.8 |
| 44345.520833333336 | 25.52 |
| 44345.53125 | 27.95 |
| 44345.541666666664 | 27.34 |
| 44345.552083333336 | 29.2 |
| 44345.5625 | 29.75 |
| 44345.572916666664 | 28.65 |
| 44345.583333333336 | 28.46 |
| 44345.59375 | 27.19 |
| 44345.604166666664 | 26.48 |
| 44345.614583333336 | 25.18 |
| 44345.625 | 24.29 |
| 44345.635416666664 | 23.35 |
| 44345.645833333336 | 22.65 |
| 44345.65625 | 21.26 |
| 44345.666666666664 | 18.25 |
| 44345.677083333336 | 16.92 |
| 44345.6875 | 16.13 |
| 44345.697916666664 | 15.26 |
| 44345.708333333336 | 18.02 |
| 44345.71875 | 19.49 |
| 44345.729166666664 | 16.82 |
| 44345.739583333336 | 16.43 |
| 44345.75 | 17.5 |
| 44345.760416666664 | 17.99 |
| 44345.770833333336 | 20.81 |
| 44345.78125 | 22.88 |
| 44345.791666666664 | 21.32 |
| 44345.802083333336 | 25.39 |
| 44345.8125 | 23.11 |
| 44345.822916666664 | 24.09 |
| 44345.833333333336 | 27.54 |
| 44345.84375 | 30.21 |
| 44345.854166666664 | 25.67 |
| 44345.864583333336 | 21.93 |
| 44345.875 | 31.03 |
| 44345.885416666664 | 37.62 |
| 44345.895833333336 | 39.53 |
| 44345.90625 | 34.72 |
| 44345.916666666664 | 36.94 |
| 44345.927083333336 | 29.51 |
| 44345.9375 | 25.66 |
| 44345.947916666664 | 19.66 |
| 44345.958333333336 | 18.01 |
| 44345.96875 | 18.1 |
| 44345.979166666664 | 20.07 |
| 44345.989583333336 | 21.41 |
| 44346.0 | 23.67 |
| 44346.010416666664 | 29.15 |
| 44346.020833333336 | 32.99 |
| 44346.03125 | 32.86 |
| 44346.041666666664 | 34.42 |
| 44346.052083333336 | 36.42 |
| 44346.0625 | 37.32 |
| 44346.072916666664 | 38.12 |
| 44346.083333333336 | 37.61 |
| 44346.09375 | 39.39 |
| 44346.104166666664 | 39.47 |
| 44346.114583333336 | 40.71 |
| 44346.125 | 60.73 |
| 44346.135416666664 | 33.54 |
| 44346.145833333336 | 33.92 |
| 44346.15625 | 31.48 |
| 44346.166666666664 | 27.17 |
| 44346.177083333336 | 30.18 |
| 44346.1875 | 31.97 |
| 44346.197916666664 | 31.16 |
| 44346.208333333336 | 27.77 |
| 44346.21875 | 25.39 |
| 44346.229166666664 | 22.42 |
| 44346.239583333336 | 20.57 |
| 44346.25 | 16.73 |
| 44346.260416666664 | 18.37 |
| 44346.270833333336 | 16.66 |
| 44346.28125 | 17.19 |
| 44346.291666666664 | 15.87 |
| 44346.302083333336 | 14.82 |
| 44346.3125 | 16.44 |
| 44346.322916666664 | 18.45 |
| 44346.333333333336 | 18.69 |
| 44346.34375 | 16.89 |
| 44346.354166666664 | 21.48 |
| 44346.364583333336 | 22.38 |
| 44346.375 | 19.15 |
| 44346.385416666664 | 25.22 |
| 44346.395833333336 | 19.01 |
| 44346.40625 | 20.69 |
| 44346.416666666664 | 22.05 |
| 44346.427083333336 | 28.61 |
| 44346.4375 | 30.9 |
| 44346.447916666664 | 25.8 |
| 44346.458333333336 | 28.32 |
| 44346.46875 | 22.15 |
| 44346.479166666664 | 23.09 |
| 44346.489583333336 | 23.04 |
| 44346.5 | 19.6 |
| 44346.510416666664 | 17.67 |
| 44346.520833333336 | 20.11 |
| 44346.53125 | 23.51 |
| 44346.541666666664 | 21.23 |
| 44346.552083333336 | 22.46 |
| 44346.5625 | 22.65 |
| 44346.572916666664 | 21.91 |
| 44346.583333333336 | 21.73 |
| 44346.59375 | 21.08 |
| 44346.604166666664 | 20.97 |
| 44346.614583333336 | 19.06 |
| 44346.625 | 20.7 |
| 44346.635416666664 | 19.27 |
| 44346.645833333336 | 18.95 |
| 44346.65625 | 18.93 |
| 44346.666666666664 | 17.13 |
| 44346.677083333336 | 18.03 |
| 44346.6875 | 16.78 |
| 44346.697916666664 | 15.74 |
| 44346.708333333336 | 15.05 |
| 44346.71875 | 13.1 |
| 44346.729166666664 | 10.72 |
| 44346.739583333336 | 28.99 |
| 44346.75 | 13.34 |
| 44346.760416666664 | 13.08 |
| 44346.770833333336 | 14.72 |
| 44346.78125 | 13.7 |
| 44346.791666666664 | 17.17 |
| 44346.802083333336 | 17.14 |
| 44346.8125 | 16.88 |
| 44346.822916666664 | 17.74 |
| 44346.833333333336 | 17.93 |
| 44346.84375 | 20.85 |
| 44346.854166666664 | 21.68 |
| 44346.864583333336 | 19.98 |
| 44346.875 | 26.03 |
| 44346.885416666664 | 24.21 |
| 44346.895833333336 | 29.39 |
| 44346.90625 | 27.65 |
| 44346.916666666664 | 26.73 |
| 44346.927083333336 | 24.89 |
| 44346.9375 | 22.1 |
| 44346.947916666664 | 19.83 |
| 44346.958333333336 | 18.15 |
| 44346.96875 | 16.94 |
| 44346.979166666664 | 15.43 |
| 44346.989583333336 | 16.54 |
| 44347.0 | 18.07 |
| 44347.010416666664 | 17.11 |
| 44347.020833333336 | 17.51 |
| 44347.03125 | 19.13 |
| 44347.041666666664 | 19.02 |
| 44347.052083333336 | 18.16 |
| 44347.0625 | 20 |
| 44347.072916666664 | 21.04 |
| 44347.083333333336 | 20.12 |
| 44347.09375 | 19.37 |
| 44347.104166666664 | 19.13 |
| 44347.114583333336 | 19.09 |
| 44347.125 | 19.23 |
| 44347.135416666664 | 20.11 |
| 44347.145833333336 | 18 |
| 44347.15625 | 17.18 |